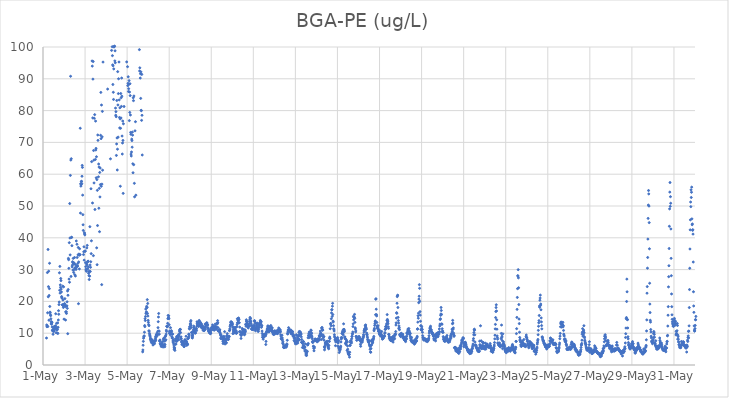
| Category | BGA-PE (ug/L) |
|---|---|
| 44682.166666666664 | 8.48 |
| 44682.177083333336 | 12.6 |
| 44682.1875 | 12.03 |
| 44682.197916666664 | 12.3 |
| 44682.208333333336 | 29.07 |
| 44682.21875 | 16.41 |
| 44682.229166666664 | 12.09 |
| 44682.239583333336 | 36.33 |
| 44682.25 | 21.45 |
| 44682.260416666664 | 24.64 |
| 44682.270833333336 | 29.49 |
| 44682.28125 | 14.09 |
| 44682.291666666664 | 21.86 |
| 44682.302083333336 | 24.02 |
| 44682.3125 | 31.99 |
| 44682.322916666664 | 18.41 |
| 44682.333333333336 | 16.64 |
| 44682.34375 | 16.41 |
| 44682.354166666664 | 15.75 |
| 44682.364583333336 | 15.52 |
| 44682.375 | 14.53 |
| 44682.385416666664 | 13.63 |
| 44682.395833333336 | 13.01 |
| 44682.40625 | 12.83 |
| 44682.416666666664 | 13.54 |
| 44682.427083333336 | 13.33 |
| 44682.4375 | 11.95 |
| 44682.447916666664 | 10.84 |
| 44682.458333333336 | 11.05 |
| 44682.46875 | 10.76 |
| 44682.479166666664 | 9.65 |
| 44682.489583333336 | 10.61 |
| 44682.5 | 10.6 |
| 44682.510416666664 | 11.41 |
| 44682.520833333336 | 12.03 |
| 44682.53125 | 10.66 |
| 44682.541666666664 | 11.07 |
| 44682.552083333336 | 11.66 |
| 44682.5625 | 11.42 |
| 44682.572916666664 | 11.94 |
| 44682.583333333336 | 12.26 |
| 44682.59375 | 12.3 |
| 44682.604166666664 | 16.11 |
| 44682.614583333336 | 11.79 |
| 44682.625 | 10.14 |
| 44682.635416666664 | 11.4 |
| 44682.645833333336 | 13.11 |
| 44682.65625 | 11.03 |
| 44682.666666666664 | 11.61 |
| 44682.677083333336 | 10.08 |
| 44682.6875 | 11.16 |
| 44682.697916666664 | 13.23 |
| 44682.708333333336 | 9.92 |
| 44682.71875 | 11.86 |
| 44682.729166666664 | 14.15 |
| 44682.739583333336 | 17.08 |
| 44682.75 | 15.95 |
| 44682.760416666664 | 18.99 |
| 44682.770833333336 | 19.8 |
| 44682.78125 | 28.99 |
| 44682.791666666664 | 23.51 |
| 44682.802083333336 | 31 |
| 44682.8125 | 22.61 |
| 44682.822916666664 | 25.19 |
| 44682.833333333336 | 24.43 |
| 44682.84375 | 27.2 |
| 44682.854166666664 | 26.53 |
| 44682.864583333336 | 23.87 |
| 44682.875 | 22.97 |
| 44682.885416666664 | 21.52 |
| 44682.895833333336 | 21.22 |
| 44682.90625 | 21.02 |
| 44682.916666666664 | 18.95 |
| 44682.927083333336 | 18.9 |
| 44682.9375 | 24.8 |
| 44682.947916666664 | 20.44 |
| 44682.958333333336 | 18.68 |
| 44682.96875 | 18.09 |
| 44682.979166666664 | 24.58 |
| 44682.989583333336 | 18.85 |
| 44683.0 | 14.42 |
| 44683.010416666664 | 19.18 |
| 44683.020833333336 | 19.02 |
| 44683.03125 | 19.28 |
| 44683.041666666664 | 20.86 |
| 44683.052083333336 | 18.71 |
| 44683.0625 | 18.36 |
| 44683.072916666664 | 14.14 |
| 44683.083333333336 | 16.68 |
| 44683.09375 | 16.72 |
| 44683.104166666664 | 16.71 |
| 44683.114583333336 | 16.22 |
| 44683.125 | 18.53 |
| 44683.135416666664 | 18.62 |
| 44683.145833333336 | 19.88 |
| 44683.15625 | 17.81 |
| 44683.166666666664 | 23.28 |
| 44683.177083333336 | 9.85 |
| 44683.1875 | 21.93 |
| 44683.197916666664 | 23.73 |
| 44683.208333333336 | 33.53 |
| 44683.21875 | 33.11 |
| 44683.229166666664 | 30.4 |
| 44683.239583333336 | 27.02 |
| 44683.25 | 38.46 |
| 44683.260416666664 | 26.03 |
| 44683.270833333336 | 50.77 |
| 44683.28125 | 39.93 |
| 44683.291666666664 | 34.62 |
| 44683.302083333336 | 59.62 |
| 44683.3125 | 90.79 |
| 44683.322916666664 | 64.45 |
| 44683.333333333336 | 27.85 |
| 44683.34375 | 64.87 |
| 44683.354166666664 | 40.15 |
| 44683.364583333336 | 40.13 |
| 44683.375 | 37.52 |
| 44683.385416666664 | 30.85 |
| 44683.395833333336 | 31.37 |
| 44683.40625 | 32.47 |
| 44683.416666666664 | 32.19 |
| 44683.427083333336 | 29.84 |
| 44683.4375 | 33.53 |
| 44683.447916666664 | 31.81 |
| 44683.458333333336 | 29.11 |
| 44683.46875 | 30 |
| 44683.479166666664 | 32.09 |
| 44683.489583333336 | 31.76 |
| 44683.5 | 33.8 |
| 44683.510416666664 | 28.39 |
| 44683.520833333336 | 30.57 |
| 44683.53125 | 30.22 |
| 44683.541666666664 | 27.98 |
| 44683.552083333336 | 31.57 |
| 44683.5625 | 30.36 |
| 44683.572916666664 | 30.06 |
| 44683.583333333336 | 39 |
| 44683.59375 | 30.98 |
| 44683.604166666664 | 31.07 |
| 44683.614583333336 | 37.96 |
| 44683.625 | 33.81 |
| 44683.635416666664 | 31 |
| 44683.645833333336 | 31.15 |
| 44683.65625 | 31.95 |
| 44683.666666666664 | 34.64 |
| 44683.677083333336 | 36.96 |
| 44683.6875 | 19.28 |
| 44683.697916666664 | 32.41 |
| 44683.708333333336 | 34.89 |
| 44683.71875 | 34.52 |
| 44683.729166666664 | 30.2 |
| 44683.739583333336 | 36.55 |
| 44683.75 | 34.7 |
| 44683.760416666664 | 34.67 |
| 44683.770833333336 | 74.45 |
| 44683.78125 | 47.77 |
| 44683.791666666664 | 57.02 |
| 44683.802083333336 | 56.25 |
| 44683.8125 | 56.72 |
| 44683.822916666664 | 57.69 |
| 44683.833333333336 | 57.76 |
| 44683.84375 | 57.03 |
| 44683.854166666664 | 59.35 |
| 44683.864583333336 | 62.77 |
| 44683.875 | 62.14 |
| 44683.885416666664 | 53.42 |
| 44683.895833333336 | 47.28 |
| 44683.90625 | 44.09 |
| 44683.916666666664 | 42.31 |
| 44683.927083333336 | 34.72 |
| 44683.9375 | 35.6 |
| 44683.947916666664 | 37.17 |
| 44683.958333333336 | 32.98 |
| 44683.96875 | 41.58 |
| 44683.979166666664 | 41.2 |
| 44683.989583333336 | 40.92 |
| 44684.0 | 35.87 |
| 44684.010416666664 | 35.76 |
| 44684.020833333336 | 32.17 |
| 44684.03125 | 30.92 |
| 44684.041666666664 | 30.11 |
| 44684.052083333336 | 29.78 |
| 44684.0625 | 29.47 |
| 44684.072916666664 | 31.79 |
| 44684.083333333336 | 36.82 |
| 44684.09375 | 31.48 |
| 44684.104166666664 | 37.62 |
| 44684.114583333336 | 32.44 |
| 44684.125 | 30.21 |
| 44684.135416666664 | 32.57 |
| 44684.145833333336 | 32.65 |
| 44684.15625 | 30.85 |
| 44684.166666666664 | 28.84 |
| 44684.177083333336 | 29.28 |
| 44684.1875 | 28.1 |
| 44684.197916666664 | 26.88 |
| 44684.208333333336 | 29.52 |
| 44684.21875 | 27.93 |
| 44684.229166666664 | 43.49 |
| 44684.239583333336 | 31.45 |
| 44684.25 | 29.4 |
| 44684.260416666664 | 30.71 |
| 44684.270833333336 | 32.48 |
| 44684.28125 | 55.42 |
| 44684.291666666664 | 35.02 |
| 44684.302083333336 | 39.05 |
| 44684.3125 | 63.95 |
| 44684.322916666664 | 103 |
| 44684.333333333336 | 95.61 |
| 44684.34375 | 93.99 |
| 44684.354166666664 | 50.95 |
| 44684.364583333336 | 77.7 |
| 44684.375 | 89.9 |
| 44684.385416666664 | 95.43 |
| 44684.395833333336 | 34.39 |
| 44684.40625 | 67.45 |
| 44684.416666666664 | 64.41 |
| 44684.427083333336 | 57.25 |
| 44684.4375 | 77.58 |
| 44684.447916666664 | 111.92 |
| 44684.458333333336 | 78.73 |
| 44684.46875 | 48.91 |
| 44684.479166666664 | 113.02 |
| 44684.489583333336 | 64.63 |
| 44684.5 | 76.7 |
| 44684.510416666664 | 67.62 |
| 44684.520833333336 | 68.11 |
| 44684.53125 | 58.88 |
| 44684.541666666664 | 65.49 |
| 44684.552083333336 | 36.84 |
| 44684.5625 | 58.31 |
| 44684.572916666664 | 31.54 |
| 44684.583333333336 | 54.92 |
| 44684.59375 | 43.85 |
| 44684.604166666664 | 72.33 |
| 44684.614583333336 | 70.64 |
| 44684.625 | 129.6 |
| 44684.635416666664 | 59.17 |
| 44684.645833333336 | 63.2 |
| 44684.65625 | 49.3 |
| 44684.666666666664 | 62.25 |
| 44684.677083333336 | 55.54 |
| 44684.6875 | 41.93 |
| 44684.697916666664 | 60.56 |
| 44684.708333333336 | 52.85 |
| 44684.71875 | 61.93 |
| 44684.729166666664 | 56.74 |
| 44684.739583333336 | 72.23 |
| 44684.75 | 85.72 |
| 44684.760416666664 | 71.18 |
| 44684.770833333336 | 56.2 |
| 44684.78125 | 81.75 |
| 44684.791666666664 | 25.27 |
| 44684.802083333336 | 56.88 |
| 44684.8125 | 71.75 |
| 44684.822916666664 | 79.75 |
| 44684.833333333336 | 61.26 |
| 44684.84375 | 126.31 |
| 44684.854166666664 | 95.26 |
| 44684.864583333336 | 129.73 |
| 44684.875 | 189.45 |
| 44684.885416666664 | 156.15 |
| 44684.895833333336 | 154.2 |
| 44684.90625 | 223.4 |
| 44684.916666666664 | 175.61 |
| 44684.927083333336 | 176.18 |
| 44684.9375 | 209.55 |
| 44684.947916666664 | 187.59 |
| 44684.958333333336 | 212.96 |
| 44684.96875 | 246.27 |
| 44684.979166666664 | 178.85 |
| 44684.989583333336 | 151.06 |
| 44685.0 | 145.45 |
| 44685.010416666664 | 174.83 |
| 44685.020833333336 | 176.13 |
| 44685.03125 | 169.92 |
| 44685.041666666664 | 243.91 |
| 44685.052083333336 | 159.7 |
| 44685.0625 | 200.52 |
| 44685.072916666664 | 86.77 |
| 44685.083333333336 | 187.3 |
| 44685.09375 | 213.55 |
| 44685.104166666664 | 164.99 |
| 44685.114583333336 | 145.71 |
| 44685.125 | 179.19 |
| 44685.135416666664 | 182.91 |
| 44685.145833333336 | 155.52 |
| 44685.15625 | 135.01 |
| 44685.166666666664 | 129.82 |
| 44685.177083333336 | 147.26 |
| 44685.1875 | 133.81 |
| 44685.197916666664 | 120.46 |
| 44685.208333333336 | 64.83 |
| 44685.21875 | 122.26 |
| 44685.229166666664 | 120.71 |
| 44685.239583333336 | 118.3 |
| 44685.25 | 101.32 |
| 44685.260416666664 | 98.93 |
| 44685.270833333336 | 103.06 |
| 44685.28125 | 114.35 |
| 44685.291666666664 | 100.1 |
| 44685.302083333336 | 97.28 |
| 44685.3125 | 94.38 |
| 44685.322916666664 | 88.21 |
| 44685.333333333336 | 94.09 |
| 44685.34375 | 85.76 |
| 44685.354166666664 | 83.51 |
| 44685.364583333336 | 93.11 |
| 44685.375 | 99.99 |
| 44685.385416666664 | 100.22 |
| 44685.395833333336 | 109.76 |
| 44685.40625 | 100.25 |
| 44685.416666666664 | 95.63 |
| 44685.427083333336 | 98.8 |
| 44685.4375 | 95.05 |
| 44685.447916666664 | 80.79 |
| 44685.458333333336 | 78.54 |
| 44685.46875 | 79.67 |
| 44685.479166666664 | 78.09 |
| 44685.489583333336 | 65.9 |
| 44685.5 | 69.51 |
| 44685.510416666664 | 83.19 |
| 44685.520833333336 | 71.4 |
| 44685.53125 | 61.33 |
| 44685.541666666664 | 67.87 |
| 44685.552083333336 | 92.25 |
| 44685.5625 | 81.77 |
| 44685.572916666664 | 71.66 |
| 44685.583333333336 | 85.35 |
| 44685.59375 | 90.01 |
| 44685.604166666664 | 141.56 |
| 44685.614583333336 | 95.28 |
| 44685.625 | 83.37 |
| 44685.635416666664 | 77.84 |
| 44685.645833333336 | 74.55 |
| 44685.65625 | 80.88 |
| 44685.666666666664 | 77.39 |
| 44685.677083333336 | 56.21 |
| 44685.6875 | 74.43 |
| 44685.697916666664 | 85.37 |
| 44685.708333333336 | 77.69 |
| 44685.71875 | 84.06 |
| 44685.729166666664 | 81.32 |
| 44685.739583333336 | 90.24 |
| 44685.75 | 84.53 |
| 44685.760416666664 | 72 |
| 44685.770833333336 | 66.34 |
| 44685.78125 | 69.81 |
| 44685.791666666664 | 76.71 |
| 44685.802083333336 | 70.62 |
| 44685.8125 | 53.97 |
| 44685.822916666664 | 75.85 |
| 44685.833333333336 | 108.89 |
| 44685.84375 | 102.08 |
| 44685.854166666664 | 81.29 |
| 44685.864583333336 | 149.47 |
| 44685.875 | 162.01 |
| 44685.885416666664 | 147.36 |
| 44685.895833333336 | 157.64 |
| 44685.90625 | 160.51 |
| 44685.916666666664 | 134.41 |
| 44685.927083333336 | 128.23 |
| 44685.9375 | 122.12 |
| 44685.947916666664 | 124.78 |
| 44685.958333333336 | 116.72 |
| 44685.96875 | 109.63 |
| 44685.979166666664 | 95.31 |
| 44685.989583333336 | 115.11 |
| 44686.0 | 105.25 |
| 44686.010416666664 | 101.8 |
| 44686.020833333336 | 93.81 |
| 44686.03125 | 87.84 |
| 44686.041666666664 | 88.56 |
| 44686.052083333336 | 90.63 |
| 44686.0625 | 86 |
| 44686.072916666664 | 86.89 |
| 44686.083333333336 | 88.25 |
| 44686.09375 | 89.42 |
| 44686.104166666664 | 76.85 |
| 44686.114583333336 | 85.84 |
| 44686.125 | 79.43 |
| 44686.135416666664 | 88.46 |
| 44686.145833333336 | 84.72 |
| 44686.15625 | 78.62 |
| 44686.166666666664 | 73.14 |
| 44686.177083333336 | 72.56 |
| 44686.1875 | 66.32 |
| 44686.197916666664 | 65.73 |
| 44686.208333333336 | 66.99 |
| 44686.21875 | 71.03 |
| 44686.229166666664 | 70.56 |
| 44686.239583333336 | 68.5 |
| 44686.25 | 73.24 |
| 44686.260416666664 | 72.28 |
| 44686.270833333336 | 63.27 |
| 44686.28125 | 60.46 |
| 44686.291666666664 | 84.05 |
| 44686.302083333336 | 83.13 |
| 44686.3125 | 62.99 |
| 44686.322916666664 | 84.59 |
| 44686.333333333336 | 123.79 |
| 44686.34375 | 57.13 |
| 44686.354166666664 | 52.88 |
| 44686.364583333336 | 102.03 |
| 44686.375 | 73.64 |
| 44686.385416666664 | 215.87 |
| 44686.395833333336 | 76.51 |
| 44686.40625 | 209.66 |
| 44686.416666666664 | 53.41 |
| 44686.427083333336 | 197.57 |
| 44686.4375 | 174.71 |
| 44686.447916666664 | 167.91 |
| 44686.458333333336 | 150.9 |
| 44686.46875 | 158.26 |
| 44686.479166666664 | 139.12 |
| 44686.489583333336 | 146.16 |
| 44686.5 | 138.58 |
| 44686.510416666664 | 122.98 |
| 44686.520833333336 | 126.64 |
| 44686.53125 | 115.49 |
| 44686.541666666664 | 107.93 |
| 44686.552083333336 | 113.42 |
| 44686.5625 | 101.58 |
| 44686.572916666664 | 104.06 |
| 44686.583333333336 | 99.17 |
| 44686.59375 | 92.46 |
| 44686.604166666664 | 93.45 |
| 44686.614583333336 | 109.2 |
| 44686.625 | 90.23 |
| 44686.635416666664 | 91.59 |
| 44686.645833333336 | 83.84 |
| 44686.65625 | 92.18 |
| 44686.666666666664 | 80.1 |
| 44686.677083333336 | 79.97 |
| 44686.6875 | 76.93 |
| 44686.697916666664 | 91.38 |
| 44686.708333333336 | 78.52 |
| 44686.71875 | 66.04 |
| 44686.739583333336 | 4.14 |
| 44686.75 | 4.73 |
| 44686.760416666664 | 6.22 |
| 44686.770833333336 | 7.43 |
| 44686.78125 | 8.42 |
| 44686.791666666664 | 8.84 |
| 44686.802083333336 | 9.1 |
| 44686.8125 | 9.13 |
| 44686.822916666664 | 10.31 |
| 44686.833333333336 | 12.41 |
| 44686.84375 | 12.06 |
| 44686.854166666664 | 14.57 |
| 44686.864583333336 | 13.98 |
| 44686.875 | 15.25 |
| 44686.885416666664 | 17.59 |
| 44686.895833333336 | 16.19 |
| 44686.90625 | 16.37 |
| 44686.916666666664 | 16.74 |
| 44686.927083333336 | 18.45 |
| 44686.9375 | 18.01 |
| 44686.947916666664 | 18.15 |
| 44686.958333333336 | 20.56 |
| 44686.96875 | 16.2 |
| 44686.979166666664 | 19.35 |
| 44686.989583333336 | 15.39 |
| 44687.0 | 14.05 |
| 44687.010416666664 | 13.42 |
| 44687.020833333336 | 12.73 |
| 44687.03125 | 10.74 |
| 44687.041666666664 | 12.37 |
| 44687.052083333336 | 10.66 |
| 44687.0625 | 9.96 |
| 44687.072916666664 | 9.51 |
| 44687.083333333336 | 9.23 |
| 44687.09375 | 8.9 |
| 44687.104166666664 | 8.12 |
| 44687.114583333336 | 8.4 |
| 44687.125 | 7.82 |
| 44687.135416666664 | 7.51 |
| 44687.145833333336 | 8.08 |
| 44687.15625 | 7.05 |
| 44687.166666666664 | 7.98 |
| 44687.177083333336 | 7.55 |
| 44687.1875 | 7.8 |
| 44687.197916666664 | 7.72 |
| 44687.208333333336 | 7.56 |
| 44687.21875 | 6.81 |
| 44687.229166666664 | 6.29 |
| 44687.239583333336 | 6.58 |
| 44687.25 | 6.87 |
| 44687.260416666664 | 6.64 |
| 44687.270833333336 | 7.44 |
| 44687.28125 | 7.55 |
| 44687.291666666664 | 7.58 |
| 44687.302083333336 | 6.71 |
| 44687.3125 | 7.37 |
| 44687.322916666664 | 7.6 |
| 44687.333333333336 | 7.52 |
| 44687.34375 | 8.36 |
| 44687.354166666664 | 8.97 |
| 44687.364583333336 | 7.85 |
| 44687.375 | 8.73 |
| 44687.385416666664 | 9.45 |
| 44687.395833333336 | 9.55 |
| 44687.40625 | 9.47 |
| 44687.416666666664 | 10.01 |
| 44687.427083333336 | 9.66 |
| 44687.4375 | 9.25 |
| 44687.447916666664 | 9.78 |
| 44687.458333333336 | 10.6 |
| 44687.46875 | 11.75 |
| 44687.479166666664 | 13.62 |
| 44687.489583333336 | 15.09 |
| 44687.5 | 16.2 |
| 44687.510416666664 | 10.73 |
| 44687.520833333336 | 10.59 |
| 44687.53125 | 9.69 |
| 44687.541666666664 | 7.62 |
| 44687.552083333336 | 7.43 |
| 44687.5625 | 7.87 |
| 44687.572916666664 | 6.72 |
| 44687.583333333336 | 6.58 |
| 44687.59375 | 6.51 |
| 44687.604166666664 | 6.5 |
| 44687.614583333336 | 6.08 |
| 44687.625 | 5.8 |
| 44687.635416666664 | 6.41 |
| 44687.645833333336 | 6.72 |
| 44687.65625 | 6.77 |
| 44687.666666666664 | 6.35 |
| 44687.677083333336 | 7.36 |
| 44687.6875 | 6.39 |
| 44687.697916666664 | 6.05 |
| 44687.708333333336 | 5.63 |
| 44687.71875 | 6.24 |
| 44687.729166666664 | 8.12 |
| 44687.739583333336 | 8.28 |
| 44687.75 | 7.44 |
| 44687.760416666664 | 8.53 |
| 44687.770833333336 | 8.53 |
| 44687.78125 | 6.51 |
| 44687.791666666664 | 5.73 |
| 44687.802083333336 | 6.38 |
| 44687.8125 | 7.59 |
| 44687.822916666664 | 8.97 |
| 44687.833333333336 | 9.23 |
| 44687.84375 | 7.94 |
| 44687.854166666664 | 9.71 |
| 44687.864583333336 | 10.94 |
| 44687.875 | 10.54 |
| 44687.885416666664 | 12.16 |
| 44687.895833333336 | 12.22 |
| 44687.90625 | 12.15 |
| 44687.916666666664 | 12.03 |
| 44687.927083333336 | 13.11 |
| 44687.9375 | 14.56 |
| 44687.947916666664 | 15.57 |
| 44687.958333333336 | 14.72 |
| 44687.96875 | 14.82 |
| 44687.979166666664 | 15.46 |
| 44687.989583333336 | 14.57 |
| 44688.0 | 12.64 |
| 44688.010416666664 | 10.01 |
| 44688.020833333336 | 10.67 |
| 44688.03125 | 10.53 |
| 44688.041666666664 | 9.96 |
| 44688.052083333336 | 9.52 |
| 44688.0625 | 11.74 |
| 44688.072916666664 | 10.47 |
| 44688.083333333336 | 10.2 |
| 44688.09375 | 9.98 |
| 44688.104166666664 | 10.8 |
| 44688.114583333336 | 10.54 |
| 44688.125 | 8.92 |
| 44688.135416666664 | 8.48 |
| 44688.145833333336 | 9.73 |
| 44688.15625 | 8.54 |
| 44688.166666666664 | 9.7 |
| 44688.177083333336 | 7.24 |
| 44688.1875 | 7.68 |
| 44688.197916666664 | 7.88 |
| 44688.208333333336 | 6.9 |
| 44688.21875 | 6.32 |
| 44688.229166666664 | 5.64 |
| 44688.239583333336 | 4.91 |
| 44688.25 | 5.13 |
| 44688.260416666664 | 5.38 |
| 44688.270833333336 | 4.59 |
| 44688.28125 | 7.62 |
| 44688.291666666664 | 6.49 |
| 44688.302083333336 | 8.26 |
| 44688.3125 | 7.82 |
| 44688.322916666664 | 6.58 |
| 44688.333333333336 | 7.91 |
| 44688.34375 | 7.37 |
| 44688.354166666664 | 8.95 |
| 44688.364583333336 | 8.34 |
| 44688.375 | 7.65 |
| 44688.385416666664 | 7.65 |
| 44688.395833333336 | 8.22 |
| 44688.40625 | 8.58 |
| 44688.416666666664 | 9.15 |
| 44688.427083333336 | 9.35 |
| 44688.4375 | 8.76 |
| 44688.447916666664 | 8.98 |
| 44688.458333333336 | 7.94 |
| 44688.46875 | 9.49 |
| 44688.479166666664 | 9.87 |
| 44688.489583333336 | 10.64 |
| 44688.5 | 10.93 |
| 44688.510416666664 | 11.13 |
| 44688.520833333336 | 11.23 |
| 44688.53125 | 11.17 |
| 44688.541666666664 | 10.19 |
| 44688.552083333336 | 8.3 |
| 44688.5625 | 8.86 |
| 44688.572916666664 | 8.28 |
| 44688.583333333336 | 7.26 |
| 44688.59375 | 7.58 |
| 44688.604166666664 | 6.42 |
| 44688.614583333336 | 6.97 |
| 44688.625 | 6.66 |
| 44688.635416666664 | 7.15 |
| 44688.645833333336 | 7.5 |
| 44688.65625 | 6.94 |
| 44688.666666666664 | 6.79 |
| 44688.677083333336 | 6.95 |
| 44688.6875 | 6.23 |
| 44688.697916666664 | 5.9 |
| 44688.708333333336 | 5.76 |
| 44688.71875 | 5.91 |
| 44688.729166666664 | 6.6 |
| 44688.739583333336 | 7.44 |
| 44688.75 | 7.99 |
| 44688.760416666664 | 7.62 |
| 44688.770833333336 | 6.65 |
| 44688.78125 | 7.7 |
| 44688.791666666664 | 7.59 |
| 44688.802083333336 | 9.04 |
| 44688.8125 | 7.35 |
| 44688.822916666664 | 7.33 |
| 44688.833333333336 | 6.18 |
| 44688.84375 | 6.78 |
| 44688.854166666664 | 6.82 |
| 44688.864583333336 | 6.51 |
| 44688.875 | 6.41 |
| 44688.885416666664 | 8.25 |
| 44688.895833333336 | 8.39 |
| 44688.90625 | 8.4 |
| 44688.916666666664 | 8.69 |
| 44688.927083333336 | 9.68 |
| 44688.9375 | 9.04 |
| 44688.947916666664 | 9.68 |
| 44688.958333333336 | 11.53 |
| 44688.96875 | 11.31 |
| 44688.979166666664 | 12.1 |
| 44688.989583333336 | 11.97 |
| 44689.0 | 12.88 |
| 44689.010416666664 | 12.99 |
| 44689.020833333336 | 13.62 |
| 44689.03125 | 13.98 |
| 44689.041666666664 | 12.48 |
| 44689.052083333336 | 11.74 |
| 44689.0625 | 10.24 |
| 44689.072916666664 | 10.23 |
| 44689.083333333336 | 9.26 |
| 44689.09375 | 8.54 |
| 44689.104166666664 | 8.53 |
| 44689.114583333336 | 9.06 |
| 44689.125 | 9.54 |
| 44689.135416666664 | 10.21 |
| 44689.145833333336 | 10.98 |
| 44689.15625 | 10.59 |
| 44689.166666666664 | 12.23 |
| 44689.177083333336 | 11.77 |
| 44689.1875 | 11.34 |
| 44689.197916666664 | 10.52 |
| 44689.208333333336 | 10.61 |
| 44689.21875 | 10.96 |
| 44689.229166666664 | 10.16 |
| 44689.239583333336 | 10.08 |
| 44689.25 | 10.03 |
| 44689.260416666664 | 11.24 |
| 44689.270833333336 | 11.39 |
| 44689.28125 | 11.39 |
| 44689.291666666664 | 11.39 |
| 44689.302083333336 | 10.82 |
| 44689.3125 | 12.18 |
| 44689.322916666664 | 13.59 |
| 44689.333333333336 | 13.01 |
| 44689.34375 | 12.64 |
| 44689.354166666664 | 12.56 |
| 44689.364583333336 | 13.02 |
| 44689.375 | 12.38 |
| 44689.385416666664 | 13.39 |
| 44689.395833333336 | 12.1 |
| 44689.40625 | 13.31 |
| 44689.416666666664 | 13.74 |
| 44689.427083333336 | 14.02 |
| 44689.4375 | 13.07 |
| 44689.447916666664 | 12.59 |
| 44689.458333333336 | 12.73 |
| 44689.46875 | 12.35 |
| 44689.479166666664 | 13.46 |
| 44689.489583333336 | 13.26 |
| 44689.5 | 12.21 |
| 44689.510416666664 | 11.97 |
| 44689.520833333336 | 12.81 |
| 44689.53125 | 12.94 |
| 44689.541666666664 | 12.32 |
| 44689.552083333336 | 11.7 |
| 44689.5625 | 11.62 |
| 44689.572916666664 | 11.89 |
| 44689.583333333336 | 12.33 |
| 44689.59375 | 11.75 |
| 44689.604166666664 | 11.88 |
| 44689.614583333336 | 10.88 |
| 44689.625 | 11.13 |
| 44689.635416666664 | 11.28 |
| 44689.645833333336 | 10.87 |
| 44689.65625 | 11.33 |
| 44689.666666666664 | 10.82 |
| 44689.677083333336 | 11.34 |
| 44689.6875 | 11.2 |
| 44689.697916666664 | 11.81 |
| 44689.708333333336 | 12.88 |
| 44689.71875 | 11.23 |
| 44689.729166666664 | 12.19 |
| 44689.739583333336 | 12.74 |
| 44689.75 | 12.82 |
| 44689.760416666664 | 12.51 |
| 44689.770833333336 | 12.68 |
| 44689.78125 | 13.3 |
| 44689.791666666664 | 12.77 |
| 44689.802083333336 | 13.16 |
| 44689.8125 | 12.69 |
| 44689.822916666664 | 11.7 |
| 44689.833333333336 | 12.58 |
| 44689.84375 | 11.73 |
| 44689.854166666664 | 11.43 |
| 44689.864583333336 | 10.79 |
| 44689.875 | 10.65 |
| 44689.885416666664 | 10.99 |
| 44689.895833333336 | 10.49 |
| 44689.90625 | 10.19 |
| 44689.916666666664 | 10.99 |
| 44689.927083333336 | 10.12 |
| 44689.9375 | 10.75 |
| 44689.947916666664 | 10.02 |
| 44689.958333333336 | 9.84 |
| 44689.96875 | 9.98 |
| 44689.979166666664 | 10.02 |
| 44689.989583333336 | 10.79 |
| 44690.0 | 11.32 |
| 44690.010416666664 | 11.55 |
| 44690.020833333336 | 11.86 |
| 44690.03125 | 11.68 |
| 44690.041666666664 | 11.5 |
| 44690.052083333336 | 11.36 |
| 44690.0625 | 12.61 |
| 44690.072916666664 | 11.78 |
| 44690.083333333336 | 12.1 |
| 44690.09375 | 11.06 |
| 44690.104166666664 | 12 |
| 44690.114583333336 | 11.7 |
| 44690.125 | 11.65 |
| 44690.135416666664 | 11.01 |
| 44690.145833333336 | 12.04 |
| 44690.15625 | 11.02 |
| 44690.166666666664 | 11.92 |
| 44690.177083333336 | 11.52 |
| 44690.1875 | 12.87 |
| 44690.197916666664 | 12.21 |
| 44690.208333333336 | 11.77 |
| 44690.21875 | 12.07 |
| 44690.229166666664 | 11.54 |
| 44690.239583333336 | 11.6 |
| 44690.25 | 11.21 |
| 44690.260416666664 | 11.89 |
| 44690.270833333336 | 13.09 |
| 44690.28125 | 12.88 |
| 44690.291666666664 | 13.23 |
| 44690.302083333336 | 13.94 |
| 44690.3125 | 13.28 |
| 44690.322916666664 | 11.76 |
| 44690.333333333336 | 10.7 |
| 44690.34375 | 10.83 |
| 44690.354166666664 | 10.66 |
| 44690.364583333336 | 10.87 |
| 44690.375 | 10.73 |
| 44690.385416666664 | 10.68 |
| 44690.395833333336 | 11.14 |
| 44690.40625 | 11.03 |
| 44690.416666666664 | 10.26 |
| 44690.427083333336 | 9.84 |
| 44690.4375 | 9.41 |
| 44690.447916666664 | 8.46 |
| 44690.458333333336 | 9.51 |
| 44690.46875 | 8.26 |
| 44690.479166666664 | 8.87 |
| 44690.489583333336 | 8.9 |
| 44690.5 | 8.84 |
| 44690.510416666664 | 8.44 |
| 44690.520833333336 | 8.84 |
| 44690.53125 | 8.78 |
| 44690.541666666664 | 8.19 |
| 44690.552083333336 | 7.4 |
| 44690.5625 | 6.75 |
| 44690.572916666664 | 7.6 |
| 44690.583333333336 | 8.13 |
| 44690.59375 | 9.01 |
| 44690.604166666664 | 8.44 |
| 44690.614583333336 | 7.18 |
| 44690.625 | 8.81 |
| 44690.635416666664 | 10.49 |
| 44690.645833333336 | 8.01 |
| 44690.65625 | 6.59 |
| 44690.666666666664 | 7.99 |
| 44690.677083333336 | 8.07 |
| 44690.6875 | 6.94 |
| 44690.697916666664 | 7.64 |
| 44690.708333333336 | 7.05 |
| 44690.71875 | 6.94 |
| 44690.729166666664 | 8.3 |
| 44690.739583333336 | 9.21 |
| 44690.75 | 9.14 |
| 44690.760416666664 | 9.87 |
| 44690.770833333336 | 8.87 |
| 44690.78125 | 8.89 |
| 44690.791666666664 | 8.76 |
| 44690.802083333336 | 7.99 |
| 44690.8125 | 8.56 |
| 44690.822916666664 | 8.11 |
| 44690.833333333336 | 9.07 |
| 44690.84375 | 8.82 |
| 44690.854166666664 | 9.01 |
| 44690.864583333336 | 10.78 |
| 44690.875 | 10.95 |
| 44690.885416666664 | 11.41 |
| 44690.895833333336 | 12.12 |
| 44690.90625 | 12.51 |
| 44690.916666666664 | 12.75 |
| 44690.927083333336 | 13.41 |
| 44690.9375 | 13.61 |
| 44690.947916666664 | 13.38 |
| 44690.958333333336 | 13.49 |
| 44690.96875 | 13.08 |
| 44690.979166666664 | 13.35 |
| 44690.989583333336 | 12.45 |
| 44691.0 | 13.12 |
| 44691.010416666664 | 12.78 |
| 44691.020833333336 | 11.87 |
| 44691.03125 | 9.85 |
| 44691.041666666664 | 11.11 |
| 44691.052083333336 | 10.39 |
| 44691.0625 | 10.71 |
| 44691.072916666664 | 11.8 |
| 44691.083333333336 | 10.05 |
| 44691.09375 | 11.25 |
| 44691.104166666664 | 10.93 |
| 44691.114583333336 | 10.38 |
| 44691.125 | 11.48 |
| 44691.135416666664 | 11.84 |
| 44691.145833333336 | 11.66 |
| 44691.15625 | 10.79 |
| 44691.166666666664 | 10.84 |
| 44691.177083333336 | 10.72 |
| 44691.1875 | 9.94 |
| 44691.197916666664 | 10.38 |
| 44691.208333333336 | 10.03 |
| 44691.21875 | 12.04 |
| 44691.229166666664 | 12.7 |
| 44691.239583333336 | 14.54 |
| 44691.25 | 13.28 |
| 44691.260416666664 | 13.24 |
| 44691.270833333336 | 13.95 |
| 44691.28125 | 14.7 |
| 44691.291666666664 | 14.12 |
| 44691.302083333336 | 14.76 |
| 44691.3125 | 13.27 |
| 44691.322916666664 | 14.35 |
| 44691.333333333336 | 13.3 |
| 44691.34375 | 10.48 |
| 44691.354166666664 | 11.92 |
| 44691.364583333336 | 10.47 |
| 44691.375 | 10.36 |
| 44691.385416666664 | 10.37 |
| 44691.395833333336 | 9.53 |
| 44691.40625 | 9.53 |
| 44691.416666666664 | 8.36 |
| 44691.427083333336 | 9.25 |
| 44691.4375 | 9.58 |
| 44691.447916666664 | 9.69 |
| 44691.458333333336 | 10.17 |
| 44691.46875 | 11.49 |
| 44691.479166666664 | 10.02 |
| 44691.489583333336 | 11.14 |
| 44691.5 | 10.92 |
| 44691.510416666664 | 10.14 |
| 44691.520833333336 | 10.59 |
| 44691.53125 | 10.53 |
| 44691.541666666664 | 10.33 |
| 44691.552083333336 | 11.16 |
| 44691.5625 | 10.44 |
| 44691.572916666664 | 9.5 |
| 44691.583333333336 | 10.52 |
| 44691.59375 | 9.65 |
| 44691.604166666664 | 10.22 |
| 44691.614583333336 | 11 |
| 44691.625 | 10.61 |
| 44691.635416666664 | 12.81 |
| 44691.645833333336 | 12.59 |
| 44691.65625 | 12.18 |
| 44691.666666666664 | 14.21 |
| 44691.677083333336 | 13.71 |
| 44691.6875 | 13.75 |
| 44691.697916666664 | 13.18 |
| 44691.708333333336 | 12.68 |
| 44691.71875 | 13.1 |
| 44691.729166666664 | 11.98 |
| 44691.739583333336 | 12.51 |
| 44691.75 | 12.29 |
| 44691.760416666664 | 11.65 |
| 44691.770833333336 | 12.27 |
| 44691.78125 | 12.36 |
| 44691.791666666664 | 12.4 |
| 44691.802083333336 | 12.2 |
| 44691.8125 | 13.73 |
| 44691.822916666664 | 13.07 |
| 44691.833333333336 | 14.38 |
| 44691.84375 | 14.96 |
| 44691.854166666664 | 14.51 |
| 44691.864583333336 | 14.67 |
| 44691.875 | 13.54 |
| 44691.885416666664 | 13.8 |
| 44691.895833333336 | 12.95 |
| 44691.90625 | 12.31 |
| 44691.916666666664 | 11.3 |
| 44691.927083333336 | 11.23 |
| 44691.9375 | 11.45 |
| 44691.947916666664 | 11.74 |
| 44691.958333333336 | 11.23 |
| 44691.96875 | 11.31 |
| 44691.979166666664 | 12.39 |
| 44691.989583333336 | 11.1 |
| 44692.0 | 12 |
| 44692.010416666664 | 11.58 |
| 44692.020833333336 | 11.58 |
| 44692.03125 | 12.24 |
| 44692.041666666664 | 12.45 |
| 44692.052083333336 | 13.89 |
| 44692.0625 | 13.91 |
| 44692.072916666664 | 13.58 |
| 44692.083333333336 | 13.08 |
| 44692.09375 | 11.14 |
| 44692.104166666664 | 10.76 |
| 44692.114583333336 | 11.29 |
| 44692.125 | 11.87 |
| 44692.135416666664 | 11.65 |
| 44692.145833333336 | 11.55 |
| 44692.15625 | 12.37 |
| 44692.166666666664 | 12.8 |
| 44692.177083333336 | 13.05 |
| 44692.1875 | 13.17 |
| 44692.197916666664 | 11.59 |
| 44692.208333333336 | 11.96 |
| 44692.21875 | 11.02 |
| 44692.229166666664 | 10.55 |
| 44692.239583333336 | 10.68 |
| 44692.25 | 11.23 |
| 44692.260416666664 | 12.28 |
| 44692.270833333336 | 11.78 |
| 44692.28125 | 12.9 |
| 44692.291666666664 | 12.77 |
| 44692.302083333336 | 12.58 |
| 44692.3125 | 13.36 |
| 44692.322916666664 | 13.38 |
| 44692.333333333336 | 14.01 |
| 44692.34375 | 13.73 |
| 44692.354166666664 | 13.26 |
| 44692.364583333336 | 12.85 |
| 44692.375 | 13.61 |
| 44692.385416666664 | 11.83 |
| 44692.395833333336 | 12.25 |
| 44692.40625 | 12.41 |
| 44692.416666666664 | 10.67 |
| 44692.427083333336 | 9.91 |
| 44692.4375 | 8.72 |
| 44692.447916666664 | 9.4 |
| 44692.458333333336 | 9.14 |
| 44692.46875 | 8.12 |
| 44692.479166666664 | 8.63 |
| 44692.489583333336 | 9.23 |
| 44692.5 | 9.58 |
| 44692.510416666664 | 8.84 |
| 44692.520833333336 | 9.28 |
| 44692.53125 | 9.51 |
| 44692.541666666664 | 9.46 |
| 44692.552083333336 | 9.23 |
| 44692.5625 | 9.68 |
| 44692.572916666664 | 9.86 |
| 44692.583333333336 | 9.17 |
| 44692.59375 | 6.45 |
| 44692.604166666664 | 7.42 |
| 44692.614583333336 | 9.77 |
| 44692.625 | 10.35 |
| 44692.635416666664 | 10.42 |
| 44692.645833333336 | 10.97 |
| 44692.65625 | 10.49 |
| 44692.666666666664 | 11.39 |
| 44692.677083333336 | 11.56 |
| 44692.6875 | 12.18 |
| 44692.697916666664 | 12.32 |
| 44692.708333333336 | 11.69 |
| 44692.71875 | 11.07 |
| 44692.729166666664 | 11.59 |
| 44692.739583333336 | 10.38 |
| 44692.75 | 10.54 |
| 44692.760416666664 | 12.02 |
| 44692.770833333336 | 11.79 |
| 44692.78125 | 10.91 |
| 44692.791666666664 | 11.36 |
| 44692.802083333336 | 11.22 |
| 44692.8125 | 11.04 |
| 44692.822916666664 | 12.07 |
| 44692.833333333336 | 12.42 |
| 44692.84375 | 11.78 |
| 44692.854166666664 | 11.73 |
| 44692.864583333336 | 11.1 |
| 44692.875 | 10.58 |
| 44692.885416666664 | 11.75 |
| 44692.895833333336 | 11.63 |
| 44692.90625 | 10.77 |
| 44692.916666666664 | 10.78 |
| 44692.927083333336 | 10.29 |
| 44692.9375 | 9.97 |
| 44692.947916666664 | 9.67 |
| 44692.958333333336 | 9.86 |
| 44692.96875 | 10.02 |
| 44692.979166666664 | 9.56 |
| 44692.989583333336 | 10.08 |
| 44693.0 | 9.9 |
| 44693.010416666664 | 10.24 |
| 44693.020833333336 | 10.77 |
| 44693.03125 | 10.55 |
| 44693.041666666664 | 10.32 |
| 44693.052083333336 | 9.87 |
| 44693.0625 | 10.53 |
| 44693.072916666664 | 10.53 |
| 44693.083333333336 | 10.14 |
| 44693.09375 | 10.69 |
| 44693.104166666664 | 10.12 |
| 44693.114583333336 | 10.26 |
| 44693.125 | 10.19 |
| 44693.135416666664 | 9.88 |
| 44693.145833333336 | 10.16 |
| 44693.15625 | 9.88 |
| 44693.166666666664 | 10.96 |
| 44693.177083333336 | 10.81 |
| 44693.1875 | 11.11 |
| 44693.197916666664 | 10.68 |
| 44693.208333333336 | 11.66 |
| 44693.21875 | 10.57 |
| 44693.229166666664 | 10.68 |
| 44693.239583333336 | 11.3 |
| 44693.25 | 10.47 |
| 44693.260416666664 | 10.35 |
| 44693.270833333336 | 10.99 |
| 44693.28125 | 11 |
| 44693.291666666664 | 10.45 |
| 44693.302083333336 | 9.5 |
| 44693.3125 | 9.09 |
| 44693.322916666664 | 8.4 |
| 44693.333333333336 | 8.17 |
| 44693.34375 | 8.16 |
| 44693.354166666664 | 8.28 |
| 44693.364583333336 | 9.36 |
| 44693.375 | 8.52 |
| 44693.385416666664 | 7.88 |
| 44693.395833333336 | 6.9 |
| 44693.40625 | 7.32 |
| 44693.416666666664 | 6.79 |
| 44693.427083333336 | 6.37 |
| 44693.4375 | 5.64 |
| 44693.447916666664 | 5.46 |
| 44693.458333333336 | 5.69 |
| 44693.46875 | 5.57 |
| 44693.479166666664 | 5.5 |
| 44693.489583333336 | 5.78 |
| 44693.5 | 5.6 |
| 44693.510416666664 | 6.06 |
| 44693.520833333336 | 5.7 |
| 44693.53125 | 6.06 |
| 44693.541666666664 | 6.04 |
| 44693.552083333336 | 6.04 |
| 44693.5625 | 5.6 |
| 44693.572916666664 | 6.29 |
| 44693.583333333336 | 5.91 |
| 44693.59375 | 6.65 |
| 44693.604166666664 | 6.37 |
| 44693.614583333336 | 7.77 |
| 44693.625 | 9.8 |
| 44693.635416666664 | 10.36 |
| 44693.645833333336 | 9.78 |
| 44693.65625 | 11 |
| 44693.666666666664 | 10.94 |
| 44693.677083333336 | 11.75 |
| 44693.6875 | 11.1 |
| 44693.697916666664 | 11.07 |
| 44693.708333333336 | 10.91 |
| 44693.71875 | 11.24 |
| 44693.729166666664 | 10.69 |
| 44693.739583333336 | 10.86 |
| 44693.75 | 10.34 |
| 44693.760416666664 | 10.79 |
| 44693.770833333336 | 10.53 |
| 44693.78125 | 10.8 |
| 44693.791666666664 | 10.98 |
| 44693.802083333336 | 9.78 |
| 44693.8125 | 9.93 |
| 44693.822916666664 | 9.99 |
| 44693.833333333336 | 10.32 |
| 44693.84375 | 10.2 |
| 44693.854166666664 | 10.51 |
| 44693.864583333336 | 10.51 |
| 44693.875 | 9.77 |
| 44693.885416666664 | 9.11 |
| 44693.895833333336 | 9.38 |
| 44693.90625 | 9.22 |
| 44693.916666666664 | 8.89 |
| 44693.927083333336 | 9.32 |
| 44693.9375 | 7.68 |
| 44693.947916666664 | 8.35 |
| 44693.958333333336 | 8.75 |
| 44693.96875 | 8.41 |
| 44693.979166666664 | 7.3 |
| 44693.989583333336 | 7.25 |
| 44694.0 | 6.67 |
| 44694.010416666664 | 7.06 |
| 44694.020833333336 | 7.37 |
| 44694.03125 | 7.86 |
| 44694.041666666664 | 9.52 |
| 44694.052083333336 | 6.7 |
| 44694.0625 | 7 |
| 44694.072916666664 | 9.27 |
| 44694.083333333336 | 8.54 |
| 44694.09375 | 7.63 |
| 44694.104166666664 | 7.45 |
| 44694.114583333336 | 6.9 |
| 44694.125 | 7.85 |
| 44694.135416666664 | 8.2 |
| 44694.145833333336 | 8.92 |
| 44694.15625 | 9.35 |
| 44694.166666666664 | 10.22 |
| 44694.177083333336 | 8.02 |
| 44694.1875 | 10.55 |
| 44694.197916666664 | 7.94 |
| 44694.208333333336 | 9.25 |
| 44694.21875 | 9.58 |
| 44694.229166666664 | 10.45 |
| 44694.239583333336 | 10.19 |
| 44694.25 | 9.79 |
| 44694.260416666664 | 9.57 |
| 44694.270833333336 | 9.78 |
| 44694.28125 | 8.84 |
| 44694.291666666664 | 7.16 |
| 44694.302083333336 | 8.01 |
| 44694.3125 | 7.09 |
| 44694.322916666664 | 7.01 |
| 44694.333333333336 | 5.5 |
| 44694.34375 | 6.96 |
| 44694.354166666664 | 7.06 |
| 44694.364583333336 | 6.29 |
| 44694.375 | 7.4 |
| 44694.385416666664 | 7.33 |
| 44694.395833333336 | 5.29 |
| 44694.40625 | 5.85 |
| 44694.416666666664 | 5.82 |
| 44694.427083333336 | 5.63 |
| 44694.4375 | 5.64 |
| 44694.447916666664 | 4.41 |
| 44694.458333333336 | 5.66 |
| 44694.46875 | 6.65 |
| 44694.479166666664 | 4.76 |
| 44694.489583333336 | 4.18 |
| 44694.5 | 3.49 |
| 44694.510416666664 | 3.06 |
| 44694.520833333336 | 3.35 |
| 44694.53125 | 2.98 |
| 44694.541666666664 | 3.82 |
| 44694.552083333336 | 4.21 |
| 44694.5625 | 4.32 |
| 44694.572916666664 | 6.5 |
| 44694.583333333336 | 6.3 |
| 44694.59375 | 6.43 |
| 44694.604166666664 | 8.55 |
| 44694.614583333336 | 6.78 |
| 44694.625 | 9.19 |
| 44694.635416666664 | 9.77 |
| 44694.645833333336 | 9.22 |
| 44694.65625 | 10.36 |
| 44694.666666666664 | 9.57 |
| 44694.677083333336 | 8.65 |
| 44694.6875 | 9.1 |
| 44694.697916666664 | 9.59 |
| 44694.708333333336 | 10.3 |
| 44694.71875 | 9.16 |
| 44694.729166666664 | 9.23 |
| 44694.739583333336 | 11 |
| 44694.75 | 10.84 |
| 44694.760416666664 | 9.78 |
| 44694.770833333336 | 10.05 |
| 44694.78125 | 9.11 |
| 44694.791666666664 | 8.79 |
| 44694.802083333336 | 8.26 |
| 44694.8125 | 7.37 |
| 44694.822916666664 | 7.06 |
| 44694.833333333336 | 7.24 |
| 44694.84375 | 7.45 |
| 44694.854166666664 | 5.91 |
| 44694.864583333336 | 5.74 |
| 44694.875 | 5.22 |
| 44694.885416666664 | 4.46 |
| 44694.895833333336 | 5.32 |
| 44694.90625 | 5.67 |
| 44694.916666666664 | 7.63 |
| 44694.927083333336 | 8.09 |
| 44694.9375 | 7.88 |
| 44694.947916666664 | 8.2 |
| 44694.958333333336 | 7.91 |
| 44694.96875 | 7.87 |
| 44694.979166666664 | 7.67 |
| 44694.989583333336 | 7.79 |
| 44695.0 | 7.69 |
| 44695.010416666664 | 7.92 |
| 44695.020833333336 | 7.83 |
| 44695.03125 | 7.26 |
| 44695.041666666664 | 7.87 |
| 44695.052083333336 | 7.83 |
| 44695.0625 | 7.53 |
| 44695.072916666664 | 8.25 |
| 44695.083333333336 | 7.57 |
| 44695.09375 | 8.1 |
| 44695.104166666664 | 8.01 |
| 44695.114583333336 | 7.87 |
| 44695.125 | 8.24 |
| 44695.135416666664 | 9.18 |
| 44695.145833333336 | 8.97 |
| 44695.15625 | 7.98 |
| 44695.166666666664 | 8.92 |
| 44695.177083333336 | 9.66 |
| 44695.1875 | 10.66 |
| 44695.197916666664 | 10.06 |
| 44695.208333333336 | 9.15 |
| 44695.21875 | 9.88 |
| 44695.229166666664 | 9.42 |
| 44695.239583333336 | 8.03 |
| 44695.25 | 11.66 |
| 44695.260416666664 | 11.58 |
| 44695.270833333336 | 11.8 |
| 44695.28125 | 10.96 |
| 44695.291666666664 | 11.14 |
| 44695.302083333336 | 10.96 |
| 44695.3125 | 9.48 |
| 44695.322916666664 | 8.5 |
| 44695.333333333336 | 8.95 |
| 44695.34375 | 8.94 |
| 44695.354166666664 | 8.91 |
| 44695.364583333336 | 7.8 |
| 44695.375 | 5.69 |
| 44695.385416666664 | 4.76 |
| 44695.395833333336 | 5.43 |
| 44695.40625 | 5.95 |
| 44695.416666666664 | 6.6 |
| 44695.427083333336 | 7.01 |
| 44695.4375 | 7.04 |
| 44695.447916666664 | 7.16 |
| 44695.458333333336 | 7.14 |
| 44695.46875 | 7.19 |
| 44695.479166666664 | 6.58 |
| 44695.489583333336 | 7.39 |
| 44695.5 | 6.68 |
| 44695.510416666664 | 6.81 |
| 44695.520833333336 | 7.45 |
| 44695.53125 | 6.56 |
| 44695.541666666664 | 6 |
| 44695.552083333336 | 6.06 |
| 44695.5625 | 5.36 |
| 44695.572916666664 | 5.65 |
| 44695.583333333336 | 5.1 |
| 44695.59375 | 6.18 |
| 44695.604166666664 | 7.52 |
| 44695.614583333336 | 7.39 |
| 44695.625 | 8.45 |
| 44695.635416666664 | 8.78 |
| 44695.645833333336 | 8.32 |
| 44695.65625 | 11.41 |
| 44695.666666666664 | 12.98 |
| 44695.677083333336 | 13.05 |
| 44695.6875 | 12.98 |
| 44695.697916666664 | 12.32 |
| 44695.708333333336 | 14.55 |
| 44695.71875 | 16.38 |
| 44695.729166666664 | 17.33 |
| 44695.739583333336 | 17.42 |
| 44695.75 | 15.26 |
| 44695.760416666664 | 18.49 |
| 44695.770833333336 | 19.4 |
| 44695.78125 | 15.87 |
| 44695.791666666664 | 13.79 |
| 44695.802083333336 | 13.55 |
| 44695.8125 | 12.36 |
| 44695.822916666664 | 11.4 |
| 44695.833333333336 | 11.09 |
| 44695.84375 | 10.7 |
| 44695.854166666664 | 9.52 |
| 44695.864583333336 | 8.97 |
| 44695.875 | 8.67 |
| 44695.885416666664 | 7.87 |
| 44695.895833333336 | 8.02 |
| 44695.90625 | 6.08 |
| 44695.916666666664 | 7.26 |
| 44695.927083333336 | 7.99 |
| 44695.9375 | 8.25 |
| 44695.947916666664 | 7.45 |
| 44695.958333333336 | 8.28 |
| 44695.96875 | 8.33 |
| 44695.979166666664 | 7.35 |
| 44695.989583333336 | 8.09 |
| 44696.0 | 8.18 |
| 44696.010416666664 | 8.62 |
| 44696.020833333336 | 5.9 |
| 44696.03125 | 6.89 |
| 44696.041666666664 | 7.27 |
| 44696.052083333336 | 7.7 |
| 44696.0625 | 5.69 |
| 44696.072916666664 | 5.19 |
| 44696.083333333336 | 3.92 |
| 44696.09375 | 4.76 |
| 44696.104166666664 | 5.13 |
| 44696.114583333336 | 4.48 |
| 44696.125 | 5.24 |
| 44696.135416666664 | 4.95 |
| 44696.145833333336 | 5.57 |
| 44696.15625 | 5.92 |
| 44696.166666666664 | 7.25 |
| 44696.177083333336 | 8.13 |
| 44696.1875 | 8.66 |
| 44696.197916666664 | 8.53 |
| 44696.208333333336 | 8.6 |
| 44696.21875 | 9.93 |
| 44696.229166666664 | 9.93 |
| 44696.239583333336 | 10.62 |
| 44696.25 | 10.01 |
| 44696.260416666664 | 10.12 |
| 44696.270833333336 | 9.5 |
| 44696.28125 | 11.13 |
| 44696.291666666664 | 12.94 |
| 44696.302083333336 | 11.13 |
| 44696.3125 | 11.23 |
| 44696.322916666664 | 10.46 |
| 44696.333333333336 | 10.73 |
| 44696.34375 | 8.8 |
| 44696.354166666664 | 8.83 |
| 44696.364583333336 | 8.26 |
| 44696.375 | 8.34 |
| 44696.385416666664 | 6.88 |
| 44696.395833333336 | 6.8 |
| 44696.40625 | 6.44 |
| 44696.416666666664 | 7.96 |
| 44696.427083333336 | 7.42 |
| 44696.4375 | 7.26 |
| 44696.447916666664 | 7.47 |
| 44696.458333333336 | 4.57 |
| 44696.46875 | 7.25 |
| 44696.479166666664 | 5.99 |
| 44696.489583333336 | 4.98 |
| 44696.5 | 3.83 |
| 44696.510416666664 | 4.1 |
| 44696.520833333336 | 3.53 |
| 44696.53125 | 3.52 |
| 44696.541666666664 | 3.21 |
| 44696.552083333336 | 3.23 |
| 44696.5625 | 3.31 |
| 44696.572916666664 | 2.48 |
| 44696.583333333336 | 4.01 |
| 44696.59375 | 6.14 |
| 44696.604166666664 | 6.2 |
| 44696.614583333336 | 7.12 |
| 44696.625 | 7.65 |
| 44696.635416666664 | 7.14 |
| 44696.645833333336 | 7.52 |
| 44696.65625 | 7.49 |
| 44696.666666666664 | 6.93 |
| 44696.677083333336 | 8.26 |
| 44696.6875 | 8.95 |
| 44696.697916666664 | 9.07 |
| 44696.708333333336 | 9.85 |
| 44696.71875 | 9.75 |
| 44696.729166666664 | 10.39 |
| 44696.739583333336 | 12.09 |
| 44696.75 | 12.95 |
| 44696.760416666664 | 15.29 |
| 44696.770833333336 | 14.19 |
| 44696.78125 | 15.11 |
| 44696.791666666664 | 14.93 |
| 44696.802083333336 | 15.01 |
| 44696.8125 | 15.92 |
| 44696.822916666664 | 14.65 |
| 44696.833333333336 | 13.41 |
| 44696.84375 | 11.69 |
| 44696.854166666664 | 11.34 |
| 44696.864583333336 | 10.4 |
| 44696.875 | 10.71 |
| 44696.885416666664 | 9.01 |
| 44696.895833333336 | 8.98 |
| 44696.90625 | 8.5 |
| 44696.916666666664 | 7.77 |
| 44696.927083333336 | 7.84 |
| 44696.9375 | 8.81 |
| 44696.947916666664 | 8.5 |
| 44696.958333333336 | 8.35 |
| 44696.96875 | 8.14 |
| 44696.979166666664 | 8.38 |
| 44696.989583333336 | 8.25 |
| 44697.0 | 8.12 |
| 44697.010416666664 | 8.35 |
| 44697.020833333336 | 8.94 |
| 44697.03125 | 8.93 |
| 44697.041666666664 | 8.59 |
| 44697.052083333336 | 8.48 |
| 44697.0625 | 7.73 |
| 44697.072916666664 | 7.91 |
| 44697.083333333336 | 7.83 |
| 44697.09375 | 6.5 |
| 44697.104166666664 | 5.88 |
| 44697.114583333336 | 7.58 |
| 44697.125 | 7.21 |
| 44697.135416666664 | 7.32 |
| 44697.145833333336 | 8 |
| 44697.15625 | 7.2 |
| 44697.166666666664 | 7.18 |
| 44697.177083333336 | 7.28 |
| 44697.1875 | 7.69 |
| 44697.197916666664 | 8.2 |
| 44697.208333333336 | 8.4 |
| 44697.21875 | 8.82 |
| 44697.229166666664 | 8.7 |
| 44697.239583333336 | 9.55 |
| 44697.25 | 9.16 |
| 44697.260416666664 | 10.34 |
| 44697.270833333336 | 10.91 |
| 44697.28125 | 10.94 |
| 44697.291666666664 | 11.42 |
| 44697.302083333336 | 10.64 |
| 44697.3125 | 11.03 |
| 44697.322916666664 | 12.46 |
| 44697.333333333336 | 12.07 |
| 44697.34375 | 12.6 |
| 44697.354166666664 | 11.78 |
| 44697.364583333336 | 11.23 |
| 44697.375 | 11.33 |
| 44697.385416666664 | 10.09 |
| 44697.395833333336 | 9.58 |
| 44697.40625 | 9.62 |
| 44697.416666666664 | 9.09 |
| 44697.427083333336 | 8.62 |
| 44697.4375 | 8.05 |
| 44697.447916666664 | 7.84 |
| 44697.458333333336 | 7.54 |
| 44697.46875 | 7.31 |
| 44697.479166666664 | 7.72 |
| 44697.489583333336 | 7.01 |
| 44697.5 | 7.65 |
| 44697.510416666664 | 7.36 |
| 44697.520833333336 | 6.38 |
| 44697.53125 | 6.28 |
| 44697.541666666664 | 5.83 |
| 44697.552083333336 | 4.93 |
| 44697.5625 | 6.16 |
| 44697.572916666664 | 4.09 |
| 44697.583333333336 | 4.01 |
| 44697.59375 | 5.19 |
| 44697.604166666664 | 6.13 |
| 44697.614583333336 | 7.61 |
| 44697.625 | 6.4 |
| 44697.635416666664 | 7.51 |
| 44697.645833333336 | 7.94 |
| 44697.65625 | 7.53 |
| 44697.666666666664 | 6.93 |
| 44697.677083333336 | 7.19 |
| 44697.6875 | 7.63 |
| 44697.697916666664 | 8.1 |
| 44697.708333333336 | 8.21 |
| 44697.71875 | 8.51 |
| 44697.729166666664 | 8.99 |
| 44697.739583333336 | 10.79 |
| 44697.75 | 11.21 |
| 44697.760416666664 | 11.53 |
| 44697.770833333336 | 12.43 |
| 44697.78125 | 12.97 |
| 44697.791666666664 | 13.58 |
| 44697.802083333336 | 13.86 |
| 44697.8125 | 15.82 |
| 44697.822916666664 | 20.67 |
| 44697.833333333336 | 20.83 |
| 44697.84375 | 17.55 |
| 44697.854166666664 | 15.85 |
| 44697.864583333336 | 15.43 |
| 44697.875 | 13.38 |
| 44697.885416666664 | 12.34 |
| 44697.895833333336 | 11.95 |
| 44697.90625 | 11.5 |
| 44697.916666666664 | 11.61 |
| 44697.927083333336 | 12.37 |
| 44697.9375 | 11.28 |
| 44697.947916666664 | 10.64 |
| 44697.958333333336 | 10.54 |
| 44697.96875 | 10.93 |
| 44697.979166666664 | 10.47 |
| 44697.989583333336 | 9.83 |
| 44698.0 | 10.9 |
| 44698.010416666664 | 9.59 |
| 44698.020833333336 | 9.62 |
| 44698.03125 | 9.25 |
| 44698.041666666664 | 9.86 |
| 44698.052083333336 | 10.05 |
| 44698.0625 | 9.28 |
| 44698.072916666664 | 9.72 |
| 44698.083333333336 | 9.24 |
| 44698.09375 | 9.5 |
| 44698.104166666664 | 10.53 |
| 44698.114583333336 | 8.7 |
| 44698.125 | 8.89 |
| 44698.135416666664 | 8.11 |
| 44698.145833333336 | 8.36 |
| 44698.15625 | 8.91 |
| 44698.166666666664 | 8.35 |
| 44698.177083333336 | 8.37 |
| 44698.1875 | 8.95 |
| 44698.197916666664 | 8.95 |
| 44698.208333333336 | 9.03 |
| 44698.21875 | 9.17 |
| 44698.229166666664 | 9.17 |
| 44698.239583333336 | 9 |
| 44698.25 | 9.93 |
| 44698.260416666664 | 10.19 |
| 44698.270833333336 | 11.2 |
| 44698.28125 | 11.19 |
| 44698.291666666664 | 12.08 |
| 44698.302083333336 | 11.94 |
| 44698.3125 | 11.48 |
| 44698.322916666664 | 12.06 |
| 44698.333333333336 | 12.6 |
| 44698.34375 | 13.06 |
| 44698.354166666664 | 14.01 |
| 44698.364583333336 | 15.85 |
| 44698.375 | 14.33 |
| 44698.385416666664 | 13.97 |
| 44698.395833333336 | 13.58 |
| 44698.40625 | 12.98 |
| 44698.416666666664 | 12.01 |
| 44698.427083333336 | 11.51 |
| 44698.4375 | 9.63 |
| 44698.447916666664 | 9.61 |
| 44698.458333333336 | 9.1 |
| 44698.46875 | 8.41 |
| 44698.479166666664 | 8.73 |
| 44698.489583333336 | 8.35 |
| 44698.5 | 7.93 |
| 44698.510416666664 | 8.09 |
| 44698.520833333336 | 7.76 |
| 44698.53125 | 7.75 |
| 44698.541666666664 | 8.55 |
| 44698.552083333336 | 7.78 |
| 44698.5625 | 7.75 |
| 44698.572916666664 | 7.67 |
| 44698.583333333336 | 7.71 |
| 44698.59375 | 7.7 |
| 44698.604166666664 | 8.71 |
| 44698.614583333336 | 8.62 |
| 44698.625 | 8.49 |
| 44698.635416666664 | 8.95 |
| 44698.645833333336 | 7.2 |
| 44698.65625 | 8 |
| 44698.666666666664 | 8.09 |
| 44698.677083333336 | 8.09 |
| 44698.6875 | 8.6 |
| 44698.697916666664 | 9.16 |
| 44698.708333333336 | 9.23 |
| 44698.71875 | 8.28 |
| 44698.729166666664 | 9.68 |
| 44698.739583333336 | 9.37 |
| 44698.75 | 9.72 |
| 44698.760416666664 | 9.68 |
| 44698.770833333336 | 10.52 |
| 44698.78125 | 12.57 |
| 44698.791666666664 | 13.26 |
| 44698.802083333336 | 14.76 |
| 44698.8125 | 16.45 |
| 44698.822916666664 | 16.25 |
| 44698.833333333336 | 19.41 |
| 44698.84375 | 21.5 |
| 44698.854166666664 | 21.82 |
| 44698.864583333336 | 21.96 |
| 44698.875 | 18.08 |
| 44698.885416666664 | 14.98 |
| 44698.895833333336 | 13.97 |
| 44698.90625 | 13.19 |
| 44698.916666666664 | 11.44 |
| 44698.927083333336 | 12.29 |
| 44698.9375 | 11.76 |
| 44698.947916666664 | 11.1 |
| 44698.958333333336 | 9.6 |
| 44698.96875 | 9.29 |
| 44698.979166666664 | 9.59 |
| 44698.989583333336 | 9.45 |
| 44699.0 | 9.11 |
| 44699.010416666664 | 8.91 |
| 44699.020833333336 | 9.17 |
| 44699.03125 | 9.98 |
| 44699.041666666664 | 9.76 |
| 44699.052083333336 | 9.57 |
| 44699.0625 | 9.46 |
| 44699.072916666664 | 9.41 |
| 44699.083333333336 | 9.15 |
| 44699.09375 | 9.55 |
| 44699.104166666664 | 9.71 |
| 44699.114583333336 | 8.84 |
| 44699.125 | 8.45 |
| 44699.135416666664 | 8.96 |
| 44699.145833333336 | 8.46 |
| 44699.15625 | 8.79 |
| 44699.166666666664 | 8.51 |
| 44699.177083333336 | 7.94 |
| 44699.1875 | 8 |
| 44699.197916666664 | 7.8 |
| 44699.208333333336 | 8.15 |
| 44699.21875 | 8.01 |
| 44699.229166666664 | 7.7 |
| 44699.239583333336 | 7.35 |
| 44699.25 | 8.15 |
| 44699.260416666664 | 8.82 |
| 44699.270833333336 | 8.1 |
| 44699.28125 | 8.36 |
| 44699.291666666664 | 9.07 |
| 44699.302083333336 | 9.9 |
| 44699.3125 | 10.17 |
| 44699.322916666664 | 10.25 |
| 44699.333333333336 | 9.79 |
| 44699.34375 | 10.95 |
| 44699.354166666664 | 11.32 |
| 44699.364583333336 | 10.3 |
| 44699.375 | 10.19 |
| 44699.385416666664 | 10.86 |
| 44699.395833333336 | 11.46 |
| 44699.40625 | 10.3 |
| 44699.416666666664 | 10.66 |
| 44699.427083333336 | 10.22 |
| 44699.4375 | 9.52 |
| 44699.447916666664 | 9.92 |
| 44699.458333333336 | 9.98 |
| 44699.46875 | 8.91 |
| 44699.479166666664 | 8.47 |
| 44699.489583333336 | 7.78 |
| 44699.5 | 8.43 |
| 44699.510416666664 | 8.07 |
| 44699.520833333336 | 8.7 |
| 44699.53125 | 7.33 |
| 44699.541666666664 | 7.3 |
| 44699.552083333336 | 7.32 |
| 44699.5625 | 7.18 |
| 44699.572916666664 | 7.26 |
| 44699.583333333336 | 7.34 |
| 44699.59375 | 7.48 |
| 44699.604166666664 | 7.04 |
| 44699.614583333336 | 7.39 |
| 44699.625 | 7.54 |
| 44699.635416666664 | 7.03 |
| 44699.645833333336 | 6.99 |
| 44699.65625 | 6.54 |
| 44699.666666666664 | 7.27 |
| 44699.677083333336 | 6.83 |
| 44699.6875 | 6.86 |
| 44699.697916666664 | 8.02 |
| 44699.708333333336 | 7.3 |
| 44699.71875 | 7.97 |
| 44699.729166666664 | 7.68 |
| 44699.739583333336 | 7.39 |
| 44699.75 | 7.42 |
| 44699.760416666664 | 7.67 |
| 44699.770833333336 | 8.49 |
| 44699.78125 | 8.64 |
| 44699.791666666664 | 9.02 |
| 44699.802083333336 | 11.27 |
| 44699.8125 | 11.38 |
| 44699.822916666664 | 13.48 |
| 44699.833333333336 | 15.51 |
| 44699.84375 | 14.72 |
| 44699.854166666664 | 16.31 |
| 44699.864583333336 | 19.59 |
| 44699.875 | 20.72 |
| 44699.885416666664 | 21.63 |
| 44699.895833333336 | 25.27 |
| 44699.90625 | 24.11 |
| 44699.916666666664 | 20.02 |
| 44699.927083333336 | 16.78 |
| 44699.9375 | 15.68 |
| 44699.947916666664 | 13.76 |
| 44699.958333333336 | 12.36 |
| 44699.96875 | 11.16 |
| 44699.979166666664 | 12.32 |
| 44699.989583333336 | 11.02 |
| 44700.0 | 11.01 |
| 44700.010416666664 | 11.99 |
| 44700.020833333336 | 11.27 |
| 44700.03125 | 11.14 |
| 44700.041666666664 | 10.28 |
| 44700.052083333336 | 9.23 |
| 44700.0625 | 8.68 |
| 44700.072916666664 | 8.45 |
| 44700.083333333336 | 8.09 |
| 44700.09375 | 8.18 |
| 44700.104166666664 | 7.82 |
| 44700.114583333336 | 8.12 |
| 44700.125 | 7.96 |
| 44700.135416666664 | 8.18 |
| 44700.145833333336 | 8.39 |
| 44700.15625 | 8.06 |
| 44700.166666666664 | 8 |
| 44700.177083333336 | 7.79 |
| 44700.1875 | 7.79 |
| 44700.197916666664 | 7.9 |
| 44700.208333333336 | 7.65 |
| 44700.21875 | 7.47 |
| 44700.229166666664 | 8.01 |
| 44700.239583333336 | 7.97 |
| 44700.25 | 7.51 |
| 44700.260416666664 | 7.82 |
| 44700.270833333336 | 7.61 |
| 44700.28125 | 7.36 |
| 44700.291666666664 | 7.89 |
| 44700.302083333336 | 7.9 |
| 44700.3125 | 7.95 |
| 44700.322916666664 | 7.72 |
| 44700.333333333336 | 8.23 |
| 44700.34375 | 8.49 |
| 44700.354166666664 | 9.21 |
| 44700.364583333336 | 10.07 |
| 44700.375 | 10.76 |
| 44700.385416666664 | 10.59 |
| 44700.395833333336 | 11.42 |
| 44700.40625 | 11.81 |
| 44700.416666666664 | 11.63 |
| 44700.427083333336 | 12.2 |
| 44700.4375 | 11.05 |
| 44700.447916666664 | 11.08 |
| 44700.458333333336 | 11.01 |
| 44700.46875 | 10.57 |
| 44700.479166666664 | 10.45 |
| 44700.489583333336 | 10.03 |
| 44700.5 | 10.07 |
| 44700.510416666664 | 9.82 |
| 44700.520833333336 | 9.96 |
| 44700.53125 | 9.96 |
| 44700.541666666664 | 9.58 |
| 44700.552083333336 | 9.15 |
| 44700.5625 | 9.22 |
| 44700.572916666664 | 8.96 |
| 44700.583333333336 | 8.26 |
| 44700.59375 | 7.87 |
| 44700.604166666664 | 8.12 |
| 44700.614583333336 | 9.34 |
| 44700.625 | 9.24 |
| 44700.635416666664 | 9.2 |
| 44700.645833333336 | 8.26 |
| 44700.65625 | 8.22 |
| 44700.666666666664 | 7.58 |
| 44700.677083333336 | 8.91 |
| 44700.6875 | 9.47 |
| 44700.697916666664 | 9.82 |
| 44700.708333333336 | 9.52 |
| 44700.71875 | 8.95 |
| 44700.729166666664 | 9.39 |
| 44700.739583333336 | 9.43 |
| 44700.75 | 9.87 |
| 44700.760416666664 | 10.14 |
| 44700.770833333336 | 8.87 |
| 44700.78125 | 9.07 |
| 44700.791666666664 | 9.46 |
| 44700.802083333336 | 9.9 |
| 44700.8125 | 9.9 |
| 44700.822916666664 | 9.72 |
| 44700.833333333336 | 10.23 |
| 44700.84375 | 11.34 |
| 44700.854166666664 | 10.5 |
| 44700.864583333336 | 12.27 |
| 44700.875 | 12.86 |
| 44700.885416666664 | 14.3 |
| 44700.895833333336 | 14.54 |
| 44700.90625 | 15.62 |
| 44700.916666666664 | 16.02 |
| 44700.927083333336 | 18.09 |
| 44700.9375 | 17.13 |
| 44700.947916666664 | 15.91 |
| 44700.958333333336 | 12.94 |
| 44700.96875 | 12.78 |
| 44700.979166666664 | 11.41 |
| 44700.989583333336 | 10.43 |
| 44701.0 | 10.75 |
| 44701.010416666664 | 10.29 |
| 44701.020833333336 | 10.28 |
| 44701.03125 | 8.93 |
| 44701.041666666664 | 8.11 |
| 44701.052083333336 | 8.57 |
| 44701.0625 | 8.08 |
| 44701.072916666664 | 7.6 |
| 44701.083333333336 | 7.51 |
| 44701.09375 | 7.87 |
| 44701.104166666664 | 7.64 |
| 44701.114583333336 | 7.42 |
| 44701.125 | 8.2 |
| 44701.135416666664 | 7.97 |
| 44701.145833333336 | 7.94 |
| 44701.15625 | 8.76 |
| 44701.166666666664 | 8.04 |
| 44701.177083333336 | 8.57 |
| 44701.1875 | 8.2 |
| 44701.197916666664 | 8.72 |
| 44701.208333333336 | 9.27 |
| 44701.21875 | 8.22 |
| 44701.229166666664 | 7.88 |
| 44701.239583333336 | 7.46 |
| 44701.25 | 7.49 |
| 44701.260416666664 | 7.54 |
| 44701.270833333336 | 7.12 |
| 44701.28125 | 7.37 |
| 44701.291666666664 | 7.84 |
| 44701.302083333336 | 7.85 |
| 44701.3125 | 7.68 |
| 44701.322916666664 | 7.76 |
| 44701.333333333336 | 7.28 |
| 44701.34375 | 7.89 |
| 44701.354166666664 | 7.88 |
| 44701.364583333336 | 8.41 |
| 44701.375 | 9.09 |
| 44701.385416666664 | 8.38 |
| 44701.395833333336 | 9.44 |
| 44701.40625 | 8.81 |
| 44701.416666666664 | 9.52 |
| 44701.427083333336 | 9.85 |
| 44701.4375 | 10.02 |
| 44701.447916666664 | 11.27 |
| 44701.458333333336 | 10.61 |
| 44701.46875 | 12.97 |
| 44701.479166666664 | 14.04 |
| 44701.489583333336 | 13.19 |
| 44701.5 | 11.26 |
| 44701.510416666664 | 11.66 |
| 44701.520833333336 | 10.03 |
| 44701.53125 | 9.43 |
| 44701.541666666664 | 9 |
| 44701.552083333336 | 9.27 |
| 44701.5625 | 5.41 |
| 44701.572916666664 | 5.51 |
| 44701.583333333336 | 5.45 |
| 44701.59375 | 5.58 |
| 44701.604166666664 | 5.13 |
| 44701.614583333336 | 5.38 |
| 44701.625 | 4.43 |
| 44701.635416666664 | 4.73 |
| 44701.645833333336 | 4.77 |
| 44701.65625 | 5.28 |
| 44701.666666666664 | 4.36 |
| 44701.677083333336 | 5.03 |
| 44701.6875 | 4.37 |
| 44701.697916666664 | 4.57 |
| 44701.708333333336 | 4.12 |
| 44701.71875 | 4.77 |
| 44701.729166666664 | 3.95 |
| 44701.739583333336 | 4.24 |
| 44701.75 | 4.63 |
| 44701.760416666664 | 4.37 |
| 44701.770833333336 | 3.64 |
| 44701.78125 | 5.36 |
| 44701.791666666664 | 4.28 |
| 44701.802083333336 | 4.19 |
| 44701.8125 | 4.2 |
| 44701.822916666664 | 5.01 |
| 44701.833333333336 | 5.51 |
| 44701.84375 | 6.07 |
| 44701.854166666664 | 5.06 |
| 44701.864583333336 | 5.78 |
| 44701.875 | 5.97 |
| 44701.885416666664 | 6.38 |
| 44701.895833333336 | 6.88 |
| 44701.90625 | 7.82 |
| 44701.916666666664 | 7.28 |
| 44701.927083333336 | 7.25 |
| 44701.9375 | 7.66 |
| 44701.947916666664 | 7.98 |
| 44701.958333333336 | 8.15 |
| 44701.96875 | 8.6 |
| 44701.979166666664 | 8.22 |
| 44701.989583333336 | 8.42 |
| 44702.0 | 7 |
| 44702.010416666664 | 5.72 |
| 44702.020833333336 | 6.25 |
| 44702.03125 | 6.74 |
| 44702.041666666664 | 6.72 |
| 44702.052083333336 | 6.85 |
| 44702.0625 | 6.71 |
| 44702.072916666664 | 7.14 |
| 44702.083333333336 | 7.12 |
| 44702.09375 | 6.75 |
| 44702.104166666664 | 6.44 |
| 44702.114583333336 | 6.22 |
| 44702.125 | 5.63 |
| 44702.135416666664 | 5.71 |
| 44702.145833333336 | 5.34 |
| 44702.15625 | 5.23 |
| 44702.166666666664 | 5.03 |
| 44702.177083333336 | 4.72 |
| 44702.1875 | 4.66 |
| 44702.197916666664 | 5.08 |
| 44702.208333333336 | 4.21 |
| 44702.21875 | 4.55 |
| 44702.229166666664 | 4.73 |
| 44702.239583333336 | 4.04 |
| 44702.25 | 4 |
| 44702.260416666664 | 4.47 |
| 44702.270833333336 | 4 |
| 44702.28125 | 4.2 |
| 44702.291666666664 | 3.56 |
| 44702.302083333336 | 4.59 |
| 44702.3125 | 4.35 |
| 44702.322916666664 | 3.83 |
| 44702.333333333336 | 3.97 |
| 44702.34375 | 3.73 |
| 44702.354166666664 | 3.73 |
| 44702.364583333336 | 4.43 |
| 44702.375 | 4.18 |
| 44702.385416666664 | 4.32 |
| 44702.395833333336 | 5.06 |
| 44702.40625 | 5.06 |
| 44702.416666666664 | 5.28 |
| 44702.427083333336 | 5.75 |
| 44702.4375 | 6.2 |
| 44702.447916666664 | 6.59 |
| 44702.458333333336 | 7.72 |
| 44702.46875 | 8.31 |
| 44702.479166666664 | 9.48 |
| 44702.489583333336 | 10.23 |
| 44702.5 | 11.06 |
| 44702.510416666664 | 11.27 |
| 44702.520833333336 | 10.97 |
| 44702.53125 | 9.49 |
| 44702.541666666664 | 7.22 |
| 44702.552083333336 | 6.31 |
| 44702.5625 | 6.13 |
| 44702.572916666664 | 6.02 |
| 44702.583333333336 | 6.28 |
| 44702.59375 | 6.04 |
| 44702.604166666664 | 5.46 |
| 44702.614583333336 | 5.55 |
| 44702.625 | 5.4 |
| 44702.635416666664 | 5.04 |
| 44702.645833333336 | 5.23 |
| 44702.65625 | 4.78 |
| 44702.666666666664 | 4.68 |
| 44702.677083333336 | 4.43 |
| 44702.6875 | 4.29 |
| 44702.697916666664 | 4.83 |
| 44702.708333333336 | 4.35 |
| 44702.71875 | 4.5 |
| 44702.729166666664 | 4.18 |
| 44702.739583333336 | 5.38 |
| 44702.75 | 4.37 |
| 44702.760416666664 | 7.49 |
| 44702.770833333336 | 6.4 |
| 44702.78125 | 5.99 |
| 44702.791666666664 | 6.21 |
| 44702.802083333336 | 12.33 |
| 44702.8125 | 5.61 |
| 44702.822916666664 | 5.3 |
| 44702.833333333336 | 7.61 |
| 44702.84375 | 5.21 |
| 44702.854166666664 | 5.64 |
| 44702.864583333336 | 5.12 |
| 44702.875 | 5.3 |
| 44702.885416666664 | 6.15 |
| 44702.895833333336 | 5.88 |
| 44702.90625 | 7.05 |
| 44702.916666666664 | 7.02 |
| 44702.927083333336 | 7.08 |
| 44702.9375 | 5.93 |
| 44702.947916666664 | 5.96 |
| 44702.958333333336 | 6.01 |
| 44702.96875 | 5.21 |
| 44702.979166666664 | 5.19 |
| 44702.989583333336 | 5.15 |
| 44703.0 | 5.03 |
| 44703.010416666664 | 5.61 |
| 44703.020833333336 | 6.9 |
| 44703.03125 | 5.86 |
| 44703.041666666664 | 5.4 |
| 44703.052083333336 | 4.97 |
| 44703.0625 | 5.79 |
| 44703.072916666664 | 5.78 |
| 44703.083333333336 | 6.35 |
| 44703.09375 | 6.02 |
| 44703.104166666664 | 6.66 |
| 44703.114583333336 | 6.36 |
| 44703.125 | 6.42 |
| 44703.135416666664 | 5.94 |
| 44703.145833333336 | 5.77 |
| 44703.15625 | 5.78 |
| 44703.166666666664 | 5.6 |
| 44703.177083333336 | 5.63 |
| 44703.1875 | 5.73 |
| 44703.197916666664 | 5.72 |
| 44703.208333333336 | 5.96 |
| 44703.21875 | 5.89 |
| 44703.229166666664 | 5.83 |
| 44703.239583333336 | 5.55 |
| 44703.25 | 5.86 |
| 44703.260416666664 | 6.75 |
| 44703.270833333336 | 6.19 |
| 44703.28125 | 5.97 |
| 44703.291666666664 | 5.26 |
| 44703.302083333336 | 5.07 |
| 44703.3125 | 4.28 |
| 44703.322916666664 | 4.4 |
| 44703.333333333336 | 4.69 |
| 44703.34375 | 5.27 |
| 44703.354166666664 | 4.41 |
| 44703.364583333336 | 4.35 |
| 44703.375 | 4.06 |
| 44703.385416666664 | 4 |
| 44703.395833333336 | 4.5 |
| 44703.40625 | 4.5 |
| 44703.416666666664 | 4.83 |
| 44703.427083333336 | 5.14 |
| 44703.4375 | 5.31 |
| 44703.447916666664 | 5.87 |
| 44703.458333333336 | 6.28 |
| 44703.46875 | 7.05 |
| 44703.479166666664 | 8.21 |
| 44703.489583333336 | 9.36 |
| 44703.5 | 11.35 |
| 44703.510416666664 | 12.77 |
| 44703.520833333336 | 14.92 |
| 44703.53125 | 16.82 |
| 44703.541666666664 | 18.07 |
| 44703.552083333336 | 18.94 |
| 44703.5625 | 17 |
| 44703.572916666664 | 14.22 |
| 44703.583333333336 | 11.26 |
| 44703.59375 | 9.15 |
| 44703.604166666664 | 8.63 |
| 44703.614583333336 | 8.13 |
| 44703.625 | 6.94 |
| 44703.635416666664 | 6.92 |
| 44703.645833333336 | 6.7 |
| 44703.65625 | 6.69 |
| 44703.666666666664 | 6.29 |
| 44703.677083333336 | 6.25 |
| 44703.6875 | 6.15 |
| 44703.697916666664 | 6.22 |
| 44703.708333333336 | 6.92 |
| 44703.71875 | 6.01 |
| 44703.729166666664 | 5.86 |
| 44703.739583333336 | 6.27 |
| 44703.75 | 5.71 |
| 44703.760416666664 | 6.17 |
| 44703.770833333336 | 6.11 |
| 44703.78125 | 8.28 |
| 44703.791666666664 | 9.92 |
| 44703.802083333336 | 12.56 |
| 44703.8125 | 8.66 |
| 44703.822916666664 | 9.03 |
| 44703.833333333336 | 7.68 |
| 44703.84375 | 5.92 |
| 44703.854166666664 | 5.12 |
| 44703.864583333336 | 9.8 |
| 44703.875 | 6.68 |
| 44703.885416666664 | 6.52 |
| 44703.895833333336 | 7.24 |
| 44703.90625 | 6.56 |
| 44703.916666666664 | 6.07 |
| 44703.927083333336 | 5.74 |
| 44703.9375 | 6.25 |
| 44703.947916666664 | 5.71 |
| 44703.958333333336 | 5.13 |
| 44703.96875 | 4.62 |
| 44703.979166666664 | 4.73 |
| 44703.989583333336 | 4.23 |
| 44704.0 | 4.07 |
| 44704.010416666664 | 4.33 |
| 44704.020833333336 | 4.49 |
| 44704.03125 | 3.88 |
| 44704.041666666664 | 4.12 |
| 44704.052083333336 | 5.14 |
| 44704.0625 | 4.6 |
| 44704.072916666664 | 4.88 |
| 44704.083333333336 | 4.64 |
| 44704.09375 | 5.01 |
| 44704.104166666664 | 4.56 |
| 44704.114583333336 | 4.43 |
| 44704.125 | 4.38 |
| 44704.135416666664 | 5.27 |
| 44704.145833333336 | 5.47 |
| 44704.15625 | 5.04 |
| 44704.166666666664 | 4.9 |
| 44704.177083333336 | 4.91 |
| 44704.1875 | 4.73 |
| 44704.197916666664 | 4.67 |
| 44704.208333333336 | 4.59 |
| 44704.21875 | 4.32 |
| 44704.229166666664 | 4.72 |
| 44704.239583333336 | 5.02 |
| 44704.25 | 5.17 |
| 44704.260416666664 | 5.28 |
| 44704.270833333336 | 5.01 |
| 44704.28125 | 5.58 |
| 44704.291666666664 | 5.57 |
| 44704.302083333336 | 4.88 |
| 44704.3125 | 6.14 |
| 44704.322916666664 | 6.48 |
| 44704.333333333336 | 4.86 |
| 44704.34375 | 5.92 |
| 44704.354166666664 | 5.79 |
| 44704.364583333336 | 4.93 |
| 44704.375 | 4.84 |
| 44704.385416666664 | 5.07 |
| 44704.395833333336 | 4.34 |
| 44704.40625 | 4.46 |
| 44704.416666666664 | 4.18 |
| 44704.427083333336 | 4.24 |
| 44704.4375 | 3.87 |
| 44704.447916666664 | 3.82 |
| 44704.458333333336 | 4.9 |
| 44704.46875 | 5.39 |
| 44704.479166666664 | 5.59 |
| 44704.489583333336 | 7.46 |
| 44704.5 | 7.4 |
| 44704.510416666664 | 9.87 |
| 44704.520833333336 | 11.42 |
| 44704.53125 | 14.97 |
| 44704.541666666664 | 17.49 |
| 44704.552083333336 | 21.25 |
| 44704.5625 | 24.01 |
| 44704.572916666664 | 28.1 |
| 44704.583333333336 | 27.93 |
| 44704.59375 | 29.98 |
| 44704.604166666664 | 27.4 |
| 44704.614583333336 | 24.29 |
| 44704.625 | 19.01 |
| 44704.635416666664 | 14.44 |
| 44704.645833333336 | 13.02 |
| 44704.65625 | 10.31 |
| 44704.666666666664 | 8.66 |
| 44704.677083333336 | 7.78 |
| 44704.6875 | 8.06 |
| 44704.697916666664 | 7.59 |
| 44704.708333333336 | 7.19 |
| 44704.71875 | 6.4 |
| 44704.729166666664 | 6.05 |
| 44704.739583333336 | 5.84 |
| 44704.75 | 5.9 |
| 44704.760416666664 | 6.18 |
| 44704.770833333336 | 7.08 |
| 44704.78125 | 7.02 |
| 44704.791666666664 | 6.84 |
| 44704.802083333336 | 7.55 |
| 44704.8125 | 6.9 |
| 44704.822916666664 | 6.94 |
| 44704.833333333336 | 6.2 |
| 44704.84375 | 6.25 |
| 44704.854166666664 | 6.64 |
| 44704.864583333336 | 8.01 |
| 44704.875 | 6.01 |
| 44704.885416666664 | 6.23 |
| 44704.895833333336 | 5.98 |
| 44704.90625 | 6.05 |
| 44704.916666666664 | 6.55 |
| 44704.927083333336 | 6.14 |
| 44704.9375 | 5.87 |
| 44704.947916666664 | 5.77 |
| 44704.958333333336 | 6.18 |
| 44704.96875 | 8.93 |
| 44704.979166666664 | 9.43 |
| 44704.989583333336 | 8.68 |
| 44705.0 | 8.59 |
| 44705.010416666664 | 8.17 |
| 44705.020833333336 | 7.93 |
| 44705.03125 | 7.42 |
| 44705.041666666664 | 7.55 |
| 44705.052083333336 | 6.82 |
| 44705.0625 | 6.41 |
| 44705.072916666664 | 6.08 |
| 44705.083333333336 | 6.15 |
| 44705.09375 | 5.42 |
| 44705.104166666664 | 6.03 |
| 44705.114583333336 | 5.64 |
| 44705.125 | 6.34 |
| 44705.135416666664 | 7.37 |
| 44705.145833333336 | 6.85 |
| 44705.15625 | 7.26 |
| 44705.166666666664 | 7.21 |
| 44705.177083333336 | 6.83 |
| 44705.1875 | 6.5 |
| 44705.197916666664 | 6.32 |
| 44705.208333333336 | 6.5 |
| 44705.21875 | 6.8 |
| 44705.229166666664 | 6.81 |
| 44705.239583333336 | 5.7 |
| 44705.25 | 5.77 |
| 44705.260416666664 | 5.14 |
| 44705.270833333336 | 5.2 |
| 44705.28125 | 5.44 |
| 44705.291666666664 | 5.98 |
| 44705.302083333336 | 6.21 |
| 44705.3125 | 6.27 |
| 44705.322916666664 | 6.16 |
| 44705.333333333336 | 6.15 |
| 44705.34375 | 5.61 |
| 44705.354166666664 | 4.36 |
| 44705.364583333336 | 4.28 |
| 44705.375 | 4.27 |
| 44705.385416666664 | 4.9 |
| 44705.395833333336 | 4.45 |
| 44705.40625 | 4.74 |
| 44705.416666666664 | 4.34 |
| 44705.427083333336 | 3.41 |
| 44705.4375 | 4.42 |
| 44705.447916666664 | 4.51 |
| 44705.458333333336 | 3.97 |
| 44705.46875 | 4.6 |
| 44705.479166666664 | 5.17 |
| 44705.489583333336 | 5.61 |
| 44705.5 | 6.58 |
| 44705.510416666664 | 7.05 |
| 44705.520833333336 | 7.61 |
| 44705.53125 | 8.04 |
| 44705.541666666664 | 9.52 |
| 44705.552083333336 | 10.89 |
| 44705.5625 | 12.18 |
| 44705.572916666664 | 13.28 |
| 44705.583333333336 | 13.96 |
| 44705.59375 | 15.57 |
| 44705.604166666664 | 18.54 |
| 44705.614583333336 | 18.14 |
| 44705.625 | 20.36 |
| 44705.635416666664 | 21.07 |
| 44705.645833333336 | 21.98 |
| 44705.65625 | 18.76 |
| 44705.666666666664 | 19.17 |
| 44705.677083333336 | 17.36 |
| 44705.6875 | 14.8 |
| 44705.697916666664 | 13.55 |
| 44705.708333333336 | 12.4 |
| 44705.71875 | 11.36 |
| 44705.729166666664 | 8.8 |
| 44705.739583333336 | 8.82 |
| 44705.75 | 8.53 |
| 44705.760416666664 | 8.08 |
| 44705.770833333336 | 7.79 |
| 44705.78125 | 7.58 |
| 44705.791666666664 | 7.43 |
| 44705.802083333336 | 7.55 |
| 44705.8125 | 6.91 |
| 44705.822916666664 | 6.97 |
| 44705.833333333336 | 6.77 |
| 44705.84375 | 6.59 |
| 44705.854166666664 | 6.54 |
| 44705.864583333336 | 6.23 |
| 44705.875 | 6.07 |
| 44705.885416666664 | 5.74 |
| 44705.895833333336 | 6.21 |
| 44705.90625 | 5.56 |
| 44705.916666666664 | 5.71 |
| 44705.927083333336 | 6 |
| 44705.9375 | 5.75 |
| 44705.947916666664 | 5.02 |
| 44705.958333333336 | 6.28 |
| 44705.96875 | 5.9 |
| 44705.979166666664 | 6.22 |
| 44705.989583333336 | 5.43 |
| 44706.0 | 5.92 |
| 44706.010416666664 | 6.08 |
| 44706.020833333336 | 5.74 |
| 44706.03125 | 6.21 |
| 44706.041666666664 | 6.04 |
| 44706.052083333336 | 5.87 |
| 44706.0625 | 5.82 |
| 44706.072916666664 | 5.84 |
| 44706.083333333336 | 6.33 |
| 44706.09375 | 6.71 |
| 44706.104166666664 | 7.63 |
| 44706.114583333336 | 7.51 |
| 44706.125 | 8.5 |
| 44706.135416666664 | 8.39 |
| 44706.145833333336 | 7.68 |
| 44706.15625 | 7.39 |
| 44706.166666666664 | 7.56 |
| 44706.177083333336 | 7.56 |
| 44706.1875 | 7.26 |
| 44706.197916666664 | 7.19 |
| 44706.208333333336 | 7.63 |
| 44706.21875 | 7.82 |
| 44706.229166666664 | 7.63 |
| 44706.239583333336 | 7.96 |
| 44706.25 | 6.76 |
| 44706.260416666664 | 6.46 |
| 44706.270833333336 | 6.79 |
| 44706.28125 | 6.78 |
| 44706.291666666664 | 6.49 |
| 44706.302083333336 | 6.84 |
| 44706.3125 | 6.53 |
| 44706.322916666664 | 6.54 |
| 44706.333333333336 | 6.58 |
| 44706.34375 | 6.49 |
| 44706.354166666664 | 6.85 |
| 44706.364583333336 | 6.67 |
| 44706.375 | 6.38 |
| 44706.385416666664 | 6.53 |
| 44706.395833333336 | 5.42 |
| 44706.40625 | 5.39 |
| 44706.416666666664 | 5.18 |
| 44706.427083333336 | 4.34 |
| 44706.4375 | 4.17 |
| 44706.447916666664 | 3.89 |
| 44706.458333333336 | 4.24 |
| 44706.46875 | 4.29 |
| 44706.479166666664 | 4.28 |
| 44706.489583333336 | 4.24 |
| 44706.5 | 4.51 |
| 44706.510416666664 | 4.21 |
| 44706.520833333336 | 4.71 |
| 44706.53125 | 5.25 |
| 44706.541666666664 | 5.62 |
| 44706.552083333336 | 6.33 |
| 44706.5625 | 6.91 |
| 44706.572916666664 | 8.26 |
| 44706.583333333336 | 9.07 |
| 44706.59375 | 9.94 |
| 44706.604166666664 | 12.03 |
| 44706.614583333336 | 12.96 |
| 44706.625 | 13.38 |
| 44706.635416666664 | 13.51 |
| 44706.645833333336 | 12.9 |
| 44706.65625 | 12.85 |
| 44706.666666666664 | 11.9 |
| 44706.677083333336 | 13.02 |
| 44706.6875 | 12.66 |
| 44706.697916666664 | 12.55 |
| 44706.708333333336 | 12.48 |
| 44706.71875 | 13.43 |
| 44706.729166666664 | 12.02 |
| 44706.739583333336 | 12.38 |
| 44706.75 | 10.87 |
| 44706.760416666664 | 9.72 |
| 44706.770833333336 | 9.41 |
| 44706.78125 | 9.11 |
| 44706.791666666664 | 8.07 |
| 44706.802083333336 | 8.15 |
| 44706.8125 | 7.62 |
| 44706.822916666664 | 7.51 |
| 44706.833333333336 | 8.14 |
| 44706.84375 | 7.22 |
| 44706.854166666664 | 7.29 |
| 44706.864583333336 | 7.58 |
| 44706.875 | 6.58 |
| 44706.885416666664 | 6.44 |
| 44706.895833333336 | 6.04 |
| 44706.90625 | 5.13 |
| 44706.916666666664 | 4.83 |
| 44706.927083333336 | 5.01 |
| 44706.9375 | 5.13 |
| 44706.947916666664 | 5.25 |
| 44706.958333333336 | 5.04 |
| 44706.96875 | 4.9 |
| 44706.979166666664 | 5.23 |
| 44706.989583333336 | 5.37 |
| 44707.0 | 5.1 |
| 44707.010416666664 | 4.98 |
| 44707.020833333336 | 5.1 |
| 44707.03125 | 5.35 |
| 44707.041666666664 | 5.6 |
| 44707.052083333336 | 5.67 |
| 44707.0625 | 5.29 |
| 44707.072916666664 | 4.93 |
| 44707.083333333336 | 5.53 |
| 44707.09375 | 4.95 |
| 44707.104166666664 | 5.3 |
| 44707.114583333336 | 6.46 |
| 44707.125 | 6.52 |
| 44707.135416666664 | 7.11 |
| 44707.145833333336 | 7.22 |
| 44707.15625 | 6.53 |
| 44707.166666666664 | 5.99 |
| 44707.177083333336 | 5.87 |
| 44707.1875 | 5.55 |
| 44707.197916666664 | 6.64 |
| 44707.208333333336 | 6.1 |
| 44707.21875 | 6.57 |
| 44707.229166666664 | 6.1 |
| 44707.239583333336 | 6.01 |
| 44707.25 | 6.11 |
| 44707.260416666664 | 6.48 |
| 44707.270833333336 | 6 |
| 44707.28125 | 5.65 |
| 44707.291666666664 | 5.47 |
| 44707.302083333336 | 4.95 |
| 44707.3125 | 5 |
| 44707.322916666664 | 5.19 |
| 44707.333333333336 | 4.66 |
| 44707.34375 | 4.45 |
| 44707.354166666664 | 4.28 |
| 44707.364583333336 | 4.65 |
| 44707.375 | 4.22 |
| 44707.385416666664 | 4.56 |
| 44707.395833333336 | 4.11 |
| 44707.40625 | 4.17 |
| 44707.416666666664 | 4.1 |
| 44707.427083333336 | 3.85 |
| 44707.4375 | 3.48 |
| 44707.447916666664 | 3.86 |
| 44707.458333333336 | 3.3 |
| 44707.46875 | 3.05 |
| 44707.479166666664 | 3.15 |
| 44707.489583333336 | 3.26 |
| 44707.5 | 3.4 |
| 44707.510416666664 | 3.26 |
| 44707.520833333336 | 3.37 |
| 44707.53125 | 3.48 |
| 44707.541666666664 | 3.92 |
| 44707.552083333336 | 4.31 |
| 44707.5625 | 4.33 |
| 44707.572916666664 | 4.84 |
| 44707.583333333336 | 5.53 |
| 44707.59375 | 6.31 |
| 44707.604166666664 | 6.32 |
| 44707.614583333336 | 6.78 |
| 44707.625 | 7.8 |
| 44707.635416666664 | 9.66 |
| 44707.645833333336 | 10.24 |
| 44707.65625 | 11.43 |
| 44707.666666666664 | 10.43 |
| 44707.677083333336 | 9.02 |
| 44707.6875 | 9.6 |
| 44707.697916666664 | 10.62 |
| 44707.708333333336 | 10.97 |
| 44707.71875 | 12.36 |
| 44707.729166666664 | 10.14 |
| 44707.739583333336 | 8.91 |
| 44707.75 | 8.55 |
| 44707.760416666664 | 7.81 |
| 44707.770833333336 | 7.49 |
| 44707.78125 | 6.98 |
| 44707.791666666664 | 6.81 |
| 44707.802083333336 | 6.33 |
| 44707.8125 | 6.41 |
| 44707.822916666664 | 5.72 |
| 44707.833333333336 | 5.43 |
| 44707.84375 | 5.16 |
| 44707.854166666664 | 4.77 |
| 44707.864583333336 | 5.09 |
| 44707.875 | 4.65 |
| 44707.885416666664 | 4.62 |
| 44707.895833333336 | 4.73 |
| 44707.90625 | 4.9 |
| 44707.916666666664 | 4.78 |
| 44707.927083333336 | 5.11 |
| 44707.9375 | 4.88 |
| 44707.947916666664 | 5.31 |
| 44707.958333333336 | 5.45 |
| 44707.96875 | 6.4 |
| 44707.979166666664 | 7.32 |
| 44707.989583333336 | 4.03 |
| 44708.0 | 4.2 |
| 44708.010416666664 | 4.22 |
| 44708.020833333336 | 4.83 |
| 44708.03125 | 5.03 |
| 44708.041666666664 | 4.65 |
| 44708.052083333336 | 5.13 |
| 44708.0625 | 4.47 |
| 44708.072916666664 | 4.71 |
| 44708.083333333336 | 4.35 |
| 44708.09375 | 3.58 |
| 44708.104166666664 | 3.84 |
| 44708.114583333336 | 3.7 |
| 44708.125 | 3.62 |
| 44708.135416666664 | 3.79 |
| 44708.145833333336 | 4.22 |
| 44708.15625 | 4.18 |
| 44708.166666666664 | 4.63 |
| 44708.177083333336 | 4.09 |
| 44708.1875 | 4.05 |
| 44708.197916666664 | 4.1 |
| 44708.208333333336 | 4.69 |
| 44708.21875 | 4.75 |
| 44708.229166666664 | 6.03 |
| 44708.239583333336 | 5.28 |
| 44708.25 | 5.61 |
| 44708.260416666664 | 5.58 |
| 44708.270833333336 | 5.4 |
| 44708.28125 | 5.23 |
| 44708.291666666664 | 5.23 |
| 44708.302083333336 | 4.54 |
| 44708.3125 | 4.22 |
| 44708.322916666664 | 4.08 |
| 44708.333333333336 | 4.27 |
| 44708.34375 | 4.03 |
| 44708.354166666664 | 3.8 |
| 44708.364583333336 | 4.06 |
| 44708.375 | 3.68 |
| 44708.385416666664 | 3.73 |
| 44708.395833333336 | 3.68 |
| 44708.40625 | 3.49 |
| 44708.416666666664 | 3.56 |
| 44708.427083333336 | 3.42 |
| 44708.4375 | 3.45 |
| 44708.447916666664 | 3.59 |
| 44708.458333333336 | 3.42 |
| 44708.46875 | 3.58 |
| 44708.479166666664 | 3.44 |
| 44708.489583333336 | 2.81 |
| 44708.5 | 2.6 |
| 44708.510416666664 | 2.72 |
| 44708.520833333336 | 2.88 |
| 44708.53125 | 3.38 |
| 44708.541666666664 | 3.61 |
| 44708.552083333336 | 2.84 |
| 44708.5625 | 3.44 |
| 44708.572916666664 | 3.74 |
| 44708.583333333336 | 4.12 |
| 44708.59375 | 4.09 |
| 44708.604166666664 | 3.75 |
| 44708.614583333336 | 3.85 |
| 44708.625 | 4.6 |
| 44708.635416666664 | 5.14 |
| 44708.645833333336 | 4.39 |
| 44708.65625 | 5.2 |
| 44708.666666666664 | 5.99 |
| 44708.677083333336 | 5.53 |
| 44708.6875 | 7.3 |
| 44708.697916666664 | 8.26 |
| 44708.708333333336 | 9.06 |
| 44708.71875 | 9.11 |
| 44708.729166666664 | 9.53 |
| 44708.739583333336 | 9.02 |
| 44708.75 | 8.53 |
| 44708.760416666664 | 7.7 |
| 44708.770833333336 | 6.03 |
| 44708.78125 | 6.29 |
| 44708.791666666664 | 6.21 |
| 44708.802083333336 | 6.21 |
| 44708.8125 | 6.14 |
| 44708.822916666664 | 6.54 |
| 44708.833333333336 | 6.79 |
| 44708.84375 | 7.51 |
| 44708.854166666664 | 7.32 |
| 44708.864583333336 | 7.73 |
| 44708.875 | 7.03 |
| 44708.885416666664 | 6.42 |
| 44708.895833333336 | 6.28 |
| 44708.90625 | 6.15 |
| 44708.916666666664 | 6.16 |
| 44708.927083333336 | 5.69 |
| 44708.9375 | 5.19 |
| 44708.947916666664 | 6.03 |
| 44708.958333333336 | 6.06 |
| 44708.96875 | 5.5 |
| 44708.979166666664 | 5.63 |
| 44708.989583333336 | 5.59 |
| 44709.0 | 5.21 |
| 44709.010416666664 | 5.35 |
| 44709.020833333336 | 4.59 |
| 44709.03125 | 4.15 |
| 44709.041666666664 | 5.29 |
| 44709.052083333336 | 5.81 |
| 44709.0625 | 5.99 |
| 44709.072916666664 | 4.87 |
| 44709.083333333336 | 5.11 |
| 44709.09375 | 4.3 |
| 44709.104166666664 | 4.75 |
| 44709.114583333336 | 4.58 |
| 44709.125 | 4.72 |
| 44709.135416666664 | 4.66 |
| 44709.145833333336 | 5.05 |
| 44709.15625 | 4.41 |
| 44709.166666666664 | 4.74 |
| 44709.177083333336 | 4.42 |
| 44709.1875 | 4.58 |
| 44709.197916666664 | 5.16 |
| 44709.208333333336 | 4.95 |
| 44709.21875 | 4.94 |
| 44709.229166666664 | 4.73 |
| 44709.239583333336 | 4.69 |
| 44709.25 | 4.87 |
| 44709.260416666664 | 5.03 |
| 44709.270833333336 | 6.29 |
| 44709.28125 | 7.11 |
| 44709.291666666664 | 6.31 |
| 44709.302083333336 | 6.2 |
| 44709.3125 | 5.21 |
| 44709.322916666664 | 5.2 |
| 44709.333333333336 | 4.89 |
| 44709.34375 | 5.36 |
| 44709.354166666664 | 5.2 |
| 44709.364583333336 | 5.11 |
| 44709.375 | 4.88 |
| 44709.385416666664 | 4.75 |
| 44709.395833333336 | 4.8 |
| 44709.40625 | 4.46 |
| 44709.416666666664 | 4.37 |
| 44709.427083333336 | 4.3 |
| 44709.4375 | 4.41 |
| 44709.447916666664 | 4.06 |
| 44709.458333333336 | 4.19 |
| 44709.46875 | 4.05 |
| 44709.479166666664 | 4.3 |
| 44709.489583333336 | 3.47 |
| 44709.5 | 3.69 |
| 44709.510416666664 | 3.73 |
| 44709.520833333336 | 3.7 |
| 44709.53125 | 4.26 |
| 44709.541666666664 | 4.3 |
| 44709.552083333336 | 2.83 |
| 44709.5625 | 4.49 |
| 44709.572916666664 | 4.35 |
| 44709.583333333336 | 3.83 |
| 44709.59375 | 3.89 |
| 44709.604166666664 | 3.99 |
| 44709.614583333336 | 4.63 |
| 44709.625 | 4.36 |
| 44709.635416666664 | 4.22 |
| 44709.645833333336 | 4.91 |
| 44709.65625 | 5.33 |
| 44709.666666666664 | 5.73 |
| 44709.677083333336 | 5.12 |
| 44709.6875 | 6.92 |
| 44709.697916666664 | 8.66 |
| 44709.708333333336 | 9.83 |
| 44709.71875 | 11.62 |
| 44709.729166666664 | 14.55 |
| 44709.739583333336 | 14.92 |
| 44709.75 | 19.97 |
| 44709.760416666664 | 27.01 |
| 44709.770833333336 | 23.02 |
| 44709.78125 | 14.27 |
| 44709.791666666664 | 14.28 |
| 44709.802083333336 | 11.64 |
| 44709.8125 | 8.89 |
| 44709.822916666664 | 8.23 |
| 44709.833333333336 | 7.06 |
| 44709.84375 | 6.26 |
| 44709.854166666664 | 6.51 |
| 44709.864583333336 | 6.09 |
| 44709.875 | 5.66 |
| 44709.885416666664 | 5.46 |
| 44709.895833333336 | 5.42 |
| 44709.90625 | 5.06 |
| 44709.916666666664 | 5.05 |
| 44709.927083333336 | 5.29 |
| 44709.9375 | 5.63 |
| 44709.947916666664 | 5.39 |
| 44709.958333333336 | 5.69 |
| 44709.96875 | 5.45 |
| 44709.979166666664 | 6.64 |
| 44709.989583333336 | 6.11 |
| 44710.0 | 6.15 |
| 44710.010416666664 | 6.91 |
| 44710.020833333336 | 6.47 |
| 44710.03125 | 7.36 |
| 44710.041666666664 | 6.28 |
| 44710.052083333336 | 5.36 |
| 44710.0625 | 6.71 |
| 44710.072916666664 | 5.73 |
| 44710.083333333336 | 5.43 |
| 44710.09375 | 4.99 |
| 44710.104166666664 | 5.16 |
| 44710.114583333336 | 4.76 |
| 44710.125 | 4.82 |
| 44710.135416666664 | 4.76 |
| 44710.145833333336 | 4.04 |
| 44710.15625 | 3.7 |
| 44710.166666666664 | 3.89 |
| 44710.177083333336 | 4.4 |
| 44710.1875 | 4.32 |
| 44710.197916666664 | 4.81 |
| 44710.208333333336 | 5.1 |
| 44710.21875 | 5.35 |
| 44710.229166666664 | 5.27 |
| 44710.239583333336 | 4.74 |
| 44710.25 | 4.98 |
| 44710.260416666664 | 5.07 |
| 44710.270833333336 | 5.04 |
| 44710.28125 | 5.71 |
| 44710.291666666664 | 6.87 |
| 44710.302083333336 | 6.37 |
| 44710.3125 | 5.95 |
| 44710.322916666664 | 5.75 |
| 44710.333333333336 | 5.6 |
| 44710.34375 | 5.57 |
| 44710.354166666664 | 5.33 |
| 44710.364583333336 | 5.33 |
| 44710.375 | 5.42 |
| 44710.385416666664 | 4.91 |
| 44710.395833333336 | 4.83 |
| 44710.40625 | 4.81 |
| 44710.416666666664 | 4.25 |
| 44710.427083333336 | 4.15 |
| 44710.4375 | 4.21 |
| 44710.447916666664 | 4.35 |
| 44710.458333333336 | 4.09 |
| 44710.46875 | 4.21 |
| 44710.479166666664 | 3.89 |
| 44710.489583333336 | 3.72 |
| 44710.5 | 3.54 |
| 44710.510416666664 | 3.94 |
| 44710.520833333336 | 3.45 |
| 44710.53125 | 3.48 |
| 44710.541666666664 | 3.63 |
| 44710.552083333336 | 3.91 |
| 44710.5625 | 5.05 |
| 44710.572916666664 | 4.02 |
| 44710.583333333336 | 4.83 |
| 44710.59375 | 4.93 |
| 44710.604166666664 | 3.98 |
| 44710.614583333336 | 4.35 |
| 44710.625 | 4.21 |
| 44710.635416666664 | 4.58 |
| 44710.645833333336 | 4.45 |
| 44710.65625 | 5.53 |
| 44710.666666666664 | 5.83 |
| 44710.677083333336 | 6.17 |
| 44710.6875 | 7.92 |
| 44710.697916666664 | 10.71 |
| 44710.708333333336 | 14.18 |
| 44710.71875 | 22.58 |
| 44710.729166666664 | 24.65 |
| 44710.739583333336 | 30.45 |
| 44710.75 | 33.81 |
| 44710.760416666664 | 39.6 |
| 44710.770833333336 | 46.1 |
| 44710.78125 | 50.29 |
| 44710.791666666664 | 54.87 |
| 44710.802083333336 | 53.8 |
| 44710.8125 | 49.97 |
| 44710.822916666664 | 44.77 |
| 44710.833333333336 | 36.54 |
| 44710.84375 | 25.71 |
| 44710.854166666664 | 19.16 |
| 44710.864583333336 | 16.49 |
| 44710.875 | 14.06 |
| 44710.885416666664 | 13.49 |
| 44710.895833333336 | 11.15 |
| 44710.90625 | 10.39 |
| 44710.916666666664 | 9.05 |
| 44710.927083333336 | 8.53 |
| 44710.9375 | 7.53 |
| 44710.947916666664 | 7.18 |
| 44710.958333333336 | 7.33 |
| 44710.96875 | 7.32 |
| 44710.979166666664 | 6.69 |
| 44710.989583333336 | 7.11 |
| 44711.0 | 7.85 |
| 44711.010416666664 | 7.92 |
| 44711.020833333336 | 8.61 |
| 44711.03125 | 9.9 |
| 44711.041666666664 | 10.54 |
| 44711.052083333336 | 10.15 |
| 44711.0625 | 9.61 |
| 44711.072916666664 | 8.73 |
| 44711.083333333336 | 7.02 |
| 44711.09375 | 6.83 |
| 44711.104166666664 | 6.69 |
| 44711.114583333336 | 6.25 |
| 44711.125 | 6.1 |
| 44711.135416666664 | 7.62 |
| 44711.145833333336 | 5.7 |
| 44711.15625 | 5.78 |
| 44711.166666666664 | 5.6 |
| 44711.177083333336 | 4.98 |
| 44711.1875 | 5.14 |
| 44711.197916666664 | 5.05 |
| 44711.208333333336 | 5.82 |
| 44711.21875 | 5.86 |
| 44711.229166666664 | 4.97 |
| 44711.239583333336 | 5.25 |
| 44711.25 | 5.64 |
| 44711.260416666664 | 5.82 |
| 44711.270833333336 | 5.87 |
| 44711.28125 | 5.35 |
| 44711.291666666664 | 5.67 |
| 44711.302083333336 | 5.64 |
| 44711.3125 | 6.24 |
| 44711.322916666664 | 8.49 |
| 44711.333333333336 | 7.73 |
| 44711.34375 | 7.23 |
| 44711.354166666664 | 6.9 |
| 44711.364583333336 | 6.69 |
| 44711.375 | 5.97 |
| 44711.385416666664 | 6.01 |
| 44711.395833333336 | 5.87 |
| 44711.40625 | 6.91 |
| 44711.416666666664 | 6.41 |
| 44711.427083333336 | 5.83 |
| 44711.4375 | 5.34 |
| 44711.447916666664 | 5.27 |
| 44711.458333333336 | 5.03 |
| 44711.46875 | 5.06 |
| 44711.479166666664 | 4.64 |
| 44711.489583333336 | 5.06 |
| 44711.5 | 4.63 |
| 44711.510416666664 | 4.91 |
| 44711.520833333336 | 4.74 |
| 44711.53125 | 4.87 |
| 44711.541666666664 | 4.56 |
| 44711.552083333336 | 4.65 |
| 44711.5625 | 4.67 |
| 44711.572916666664 | 5.91 |
| 44711.583333333336 | 5.3 |
| 44711.59375 | 5.32 |
| 44711.604166666664 | 4.71 |
| 44711.614583333336 | 4.15 |
| 44711.625 | 5.25 |
| 44711.635416666664 | 5.23 |
| 44711.645833333336 | 5.42 |
| 44711.65625 | 6.6 |
| 44711.666666666664 | 7.27 |
| 44711.677083333336 | 7.46 |
| 44711.6875 | 9.16 |
| 44711.697916666664 | 9.33 |
| 44711.708333333336 | 12.25 |
| 44711.71875 | 15.66 |
| 44711.729166666664 | 18.35 |
| 44711.739583333336 | 24.56 |
| 44711.75 | 27.77 |
| 44711.760416666664 | 31.22 |
| 44711.770833333336 | 36.63 |
| 44711.78125 | 43.62 |
| 44711.791666666664 | 49.09 |
| 44711.802083333336 | 54.37 |
| 44711.8125 | 57.38 |
| 44711.822916666664 | 49.89 |
| 44711.833333333336 | 52.93 |
| 44711.84375 | 50.86 |
| 44711.854166666664 | 42.78 |
| 44711.864583333336 | 33.54 |
| 44711.875 | 28.08 |
| 44711.885416666664 | 22.34 |
| 44711.895833333336 | 18.34 |
| 44711.90625 | 15.78 |
| 44711.916666666664 | 14.36 |
| 44711.927083333336 | 13.59 |
| 44711.9375 | 13.11 |
| 44711.947916666664 | 12.71 |
| 44711.958333333336 | 12.22 |
| 44711.96875 | 12.25 |
| 44711.979166666664 | 12.86 |
| 44711.989583333336 | 12.2 |
| 44712.0 | 13.8 |
| 44712.010416666664 | 14.21 |
| 44712.020833333336 | 14.65 |
| 44712.03125 | 13.78 |
| 44712.041666666664 | 13.22 |
| 44712.052083333336 | 13.05 |
| 44712.0625 | 12.56 |
| 44712.072916666664 | 13.74 |
| 44712.083333333336 | 13 |
| 44712.09375 | 9.47 |
| 44712.104166666664 | 10.59 |
| 44712.114583333336 | 9.81 |
| 44712.125 | 9.95 |
| 44712.135416666664 | 9.55 |
| 44712.145833333336 | 10.78 |
| 44712.15625 | 13.07 |
| 44712.166666666664 | 12.43 |
| 44712.177083333336 | 8.13 |
| 44712.1875 | 9.38 |
| 44712.197916666664 | 8.91 |
| 44712.208333333336 | 8.11 |
| 44712.21875 | 7.37 |
| 44712.229166666664 | 7.14 |
| 44712.239583333336 | 6.36 |
| 44712.25 | 6.42 |
| 44712.260416666664 | 6.09 |
| 44712.270833333336 | 5.49 |
| 44712.28125 | 5.92 |
| 44712.291666666664 | 5.96 |
| 44712.302083333336 | 5.8 |
| 44712.3125 | 5.61 |
| 44712.322916666664 | 5.42 |
| 44712.333333333336 | 5.93 |
| 44712.34375 | 6.4 |
| 44712.354166666664 | 7.4 |
| 44712.364583333336 | 6.29 |
| 44712.375 | 6.58 |
| 44712.385416666664 | 7.25 |
| 44712.395833333336 | 6.63 |
| 44712.40625 | 6.53 |
| 44712.416666666664 | 6.39 |
| 44712.427083333336 | 6.57 |
| 44712.4375 | 7.04 |
| 44712.447916666664 | 7.32 |
| 44712.458333333336 | 7.17 |
| 44712.46875 | 6.3 |
| 44712.479166666664 | 6.36 |
| 44712.489583333336 | 6.27 |
| 44712.5 | 6.33 |
| 44712.510416666664 | 5.82 |
| 44712.520833333336 | 5.84 |
| 44712.53125 | 5.98 |
| 44712.541666666664 | 6.06 |
| 44712.552083333336 | 5.42 |
| 44712.5625 | 5.44 |
| 44712.572916666664 | 5.48 |
| 44712.583333333336 | 5.32 |
| 44712.59375 | 5.62 |
| 44712.604166666664 | 4.08 |
| 44712.614583333336 | 6.28 |
| 44712.625 | 6.01 |
| 44712.635416666664 | 5.75 |
| 44712.645833333336 | 7.81 |
| 44712.65625 | 7.4 |
| 44712.666666666664 | 8.65 |
| 44712.677083333336 | 9.16 |
| 44712.6875 | 10.58 |
| 44712.697916666664 | 8.52 |
| 44712.708333333336 | 10.66 |
| 44712.71875 | 12.31 |
| 44712.729166666664 | 18.06 |
| 44712.739583333336 | 23.72 |
| 44712.75 | 30.42 |
| 44712.760416666664 | 36.48 |
| 44712.770833333336 | 42.5 |
| 44712.78125 | 45.65 |
| 44712.791666666664 | 51.25 |
| 44712.802083333336 | 49.79 |
| 44712.8125 | 55.09 |
| 44712.822916666664 | 52.68 |
| 44712.833333333336 | 54.32 |
| 44712.84375 | 55.93 |
| 44712.854166666664 | 45.96 |
| 44712.864583333336 | 44.11 |
| 44712.875 | 44.36 |
| 44712.885416666664 | 42.34 |
| 44712.895833333336 | 42.55 |
| 44712.90625 | 41.16 |
| 44712.916666666664 | 32.38 |
| 44712.927083333336 | 23.03 |
| 44712.9375 | 18.57 |
| 44712.947916666664 | 16.56 |
| 44712.958333333336 | 12.29 |
| 44712.96875 | 10.98 |
| 44712.979166666664 | 10.69 |
| 44712.989583333336 | 10.71 |
| 44713.0 | 11.46 |
| 44713.010416666664 | 12.45 |
| 44713.020833333336 | 14.26 |
| 44713.03125 | 14.23 |
| 44713.041666666664 | 15.27 |
| 44713.052083333336 | 14.62 |
| 44713.0625 | 15.14 |
| 44713.072916666664 | 13.95 |
| 44713.083333333336 | 14.98 |
| 44713.09375 | 15.03 |
| 44713.104166666664 | 15.01 |
| 44713.114583333336 | 14.65 |
| 44713.125 | 13.26 |
| 44713.135416666664 | 9.88 |
| 44713.145833333336 | 9.6 |
| 44713.15625 | 8.92 |